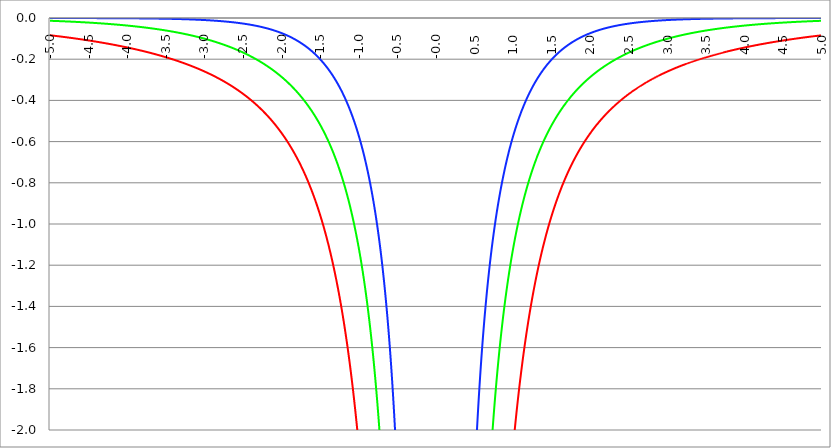
| Category | Series 1 | Series 0 | Series 2 |
|---|---|---|---|
| -5.0 | -0.084 | -0.013 | 0 |
| -4.995 | -0.084 | -0.014 | 0 |
| -4.99 | -0.084 | -0.014 | 0 |
| -4.985 | -0.084 | -0.014 | 0 |
| -4.98 | -0.085 | -0.014 | 0 |
| -4.975 | -0.085 | -0.014 | 0 |
| -4.97 | -0.085 | -0.014 | 0 |
| -4.965000000000001 | -0.085 | -0.014 | 0 |
| -4.960000000000001 | -0.086 | -0.014 | 0 |
| -4.955000000000001 | -0.086 | -0.014 | 0 |
| -4.950000000000001 | -0.086 | -0.014 | 0 |
| -4.945000000000001 | -0.086 | -0.014 | 0 |
| -4.940000000000001 | -0.086 | -0.014 | 0 |
| -4.935000000000001 | -0.087 | -0.014 | 0 |
| -4.930000000000001 | -0.087 | -0.014 | 0 |
| -4.925000000000002 | -0.087 | -0.015 | 0 |
| -4.920000000000002 | -0.087 | -0.015 | 0 |
| -4.915000000000002 | -0.088 | -0.015 | 0 |
| -4.910000000000002 | -0.088 | -0.015 | 0 |
| -4.905000000000002 | -0.088 | -0.015 | 0 |
| -4.900000000000002 | -0.088 | -0.015 | 0 |
| -4.895000000000002 | -0.088 | -0.015 | 0 |
| -4.890000000000002 | -0.089 | -0.015 | 0 |
| -4.885000000000002 | -0.089 | -0.015 | 0 |
| -4.880000000000002 | -0.089 | -0.015 | 0 |
| -4.875000000000003 | -0.089 | -0.015 | 0 |
| -4.870000000000003 | -0.09 | -0.015 | 0 |
| -4.865000000000003 | -0.09 | -0.015 | 0 |
| -4.860000000000003 | -0.09 | -0.016 | 0 |
| -4.855000000000003 | -0.09 | -0.016 | 0 |
| -4.850000000000003 | -0.091 | -0.016 | 0 |
| -4.845000000000003 | -0.091 | -0.016 | 0 |
| -4.840000000000003 | -0.091 | -0.016 | 0 |
| -4.835000000000003 | -0.091 | -0.016 | 0 |
| -4.830000000000004 | -0.092 | -0.016 | 0 |
| -4.825000000000004 | -0.092 | -0.016 | 0 |
| -4.820000000000004 | -0.092 | -0.016 | 0 |
| -4.815000000000004 | -0.092 | -0.016 | 0 |
| -4.810000000000004 | -0.093 | -0.016 | 0 |
| -4.805000000000004 | -0.093 | -0.016 | 0 |
| -4.800000000000004 | -0.093 | -0.016 | 0 |
| -4.795000000000004 | -0.093 | -0.017 | 0 |
| -4.790000000000004 | -0.093 | -0.017 | 0 |
| -4.785000000000004 | -0.094 | -0.017 | 0 |
| -4.780000000000004 | -0.094 | -0.017 | 0 |
| -4.775000000000004 | -0.094 | -0.017 | 0 |
| -4.770000000000004 | -0.094 | -0.017 | 0 |
| -4.765000000000005 | -0.095 | -0.017 | 0 |
| -4.760000000000005 | -0.095 | -0.017 | 0 |
| -4.755000000000005 | -0.095 | -0.017 | 0 |
| -4.750000000000005 | -0.095 | -0.017 | 0 |
| -4.745000000000005 | -0.096 | -0.017 | 0 |
| -4.740000000000005 | -0.096 | -0.017 | 0 |
| -4.735000000000005 | -0.096 | -0.018 | 0 |
| -4.730000000000005 | -0.096 | -0.018 | 0 |
| -4.725000000000006 | -0.097 | -0.018 | 0 |
| -4.720000000000006 | -0.097 | -0.018 | 0 |
| -4.715000000000006 | -0.097 | -0.018 | 0 |
| -4.710000000000006 | -0.097 | -0.018 | 0 |
| -4.705000000000006 | -0.098 | -0.018 | 0 |
| -4.700000000000006 | -0.098 | -0.018 | 0 |
| -4.695000000000006 | -0.098 | -0.018 | 0 |
| -4.690000000000006 | -0.099 | -0.018 | 0 |
| -4.685000000000007 | -0.099 | -0.018 | 0 |
| -4.680000000000007 | -0.099 | -0.019 | 0 |
| -4.675000000000007 | -0.099 | -0.019 | 0 |
| -4.670000000000007 | -0.1 | -0.019 | 0 |
| -4.665000000000007 | -0.1 | -0.019 | 0 |
| -4.660000000000007 | -0.1 | -0.019 | 0 |
| -4.655000000000007 | -0.1 | -0.019 | 0 |
| -4.650000000000007 | -0.101 | -0.019 | 0 |
| -4.645000000000007 | -0.101 | -0.019 | 0 |
| -4.640000000000008 | -0.101 | -0.019 | 0 |
| -4.635000000000008 | -0.101 | -0.019 | 0 |
| -4.630000000000008 | -0.102 | -0.02 | 0 |
| -4.625000000000008 | -0.102 | -0.02 | 0 |
| -4.620000000000008 | -0.102 | -0.02 | 0 |
| -4.615000000000008 | -0.103 | -0.02 | 0 |
| -4.610000000000008 | -0.103 | -0.02 | 0 |
| -4.605000000000008 | -0.103 | -0.02 | 0 |
| -4.600000000000008 | -0.103 | -0.02 | 0 |
| -4.595000000000009 | -0.104 | -0.02 | 0 |
| -4.590000000000009 | -0.104 | -0.02 | 0 |
| -4.585000000000009 | -0.104 | -0.02 | 0 |
| -4.580000000000009 | -0.104 | -0.021 | 0 |
| -4.57500000000001 | -0.105 | -0.021 | 0 |
| -4.57000000000001 | -0.105 | -0.021 | 0 |
| -4.565000000000009 | -0.105 | -0.021 | 0 |
| -4.560000000000009 | -0.106 | -0.021 | 0 |
| -4.555000000000009 | -0.106 | -0.021 | 0 |
| -4.55000000000001 | -0.106 | -0.021 | 0 |
| -4.54500000000001 | -0.106 | -0.021 | 0 |
| -4.54000000000001 | -0.107 | -0.021 | 0 |
| -4.53500000000001 | -0.107 | -0.021 | 0 |
| -4.53000000000001 | -0.107 | -0.022 | 0 |
| -4.52500000000001 | -0.108 | -0.022 | 0 |
| -4.52000000000001 | -0.108 | -0.022 | 0 |
| -4.51500000000001 | -0.108 | -0.022 | 0 |
| -4.51000000000001 | -0.108 | -0.022 | 0 |
| -4.505000000000011 | -0.109 | -0.022 | 0 |
| -4.500000000000011 | -0.109 | -0.022 | 0 |
| -4.495000000000011 | -0.109 | -0.022 | 0 |
| -4.490000000000011 | -0.11 | -0.022 | -0.001 |
| -4.485000000000011 | -0.11 | -0.023 | -0.001 |
| -4.480000000000011 | -0.11 | -0.023 | -0.001 |
| -4.475000000000011 | -0.11 | -0.023 | -0.001 |
| -4.470000000000011 | -0.111 | -0.023 | -0.001 |
| -4.465000000000011 | -0.111 | -0.023 | -0.001 |
| -4.460000000000011 | -0.111 | -0.023 | -0.001 |
| -4.455000000000012 | -0.112 | -0.023 | -0.001 |
| -4.450000000000012 | -0.112 | -0.023 | -0.001 |
| -4.445000000000012 | -0.112 | -0.023 | -0.001 |
| -4.440000000000012 | -0.113 | -0.024 | -0.001 |
| -4.435000000000012 | -0.113 | -0.024 | -0.001 |
| -4.430000000000012 | -0.113 | -0.024 | -0.001 |
| -4.425000000000012 | -0.113 | -0.024 | -0.001 |
| -4.420000000000012 | -0.114 | -0.024 | -0.001 |
| -4.415000000000012 | -0.114 | -0.024 | -0.001 |
| -4.410000000000013 | -0.114 | -0.024 | -0.001 |
| -4.405000000000013 | -0.115 | -0.024 | -0.001 |
| -4.400000000000013 | -0.115 | -0.025 | -0.001 |
| -4.395000000000013 | -0.115 | -0.025 | -0.001 |
| -4.390000000000013 | -0.116 | -0.025 | -0.001 |
| -4.385000000000013 | -0.116 | -0.025 | -0.001 |
| -4.380000000000013 | -0.116 | -0.025 | -0.001 |
| -4.375000000000013 | -0.117 | -0.025 | -0.001 |
| -4.370000000000013 | -0.117 | -0.025 | -0.001 |
| -4.365000000000013 | -0.117 | -0.025 | -0.001 |
| -4.360000000000014 | -0.117 | -0.026 | -0.001 |
| -4.355000000000014 | -0.118 | -0.026 | -0.001 |
| -4.350000000000014 | -0.118 | -0.026 | -0.001 |
| -4.345000000000014 | -0.118 | -0.026 | -0.001 |
| -4.340000000000014 | -0.119 | -0.026 | -0.001 |
| -4.335000000000014 | -0.119 | -0.026 | -0.001 |
| -4.330000000000014 | -0.119 | -0.026 | -0.001 |
| -4.325000000000014 | -0.12 | -0.026 | -0.001 |
| -4.320000000000014 | -0.12 | -0.027 | -0.001 |
| -4.315000000000015 | -0.12 | -0.027 | -0.001 |
| -4.310000000000015 | -0.121 | -0.027 | -0.001 |
| -4.305000000000015 | -0.121 | -0.027 | -0.001 |
| -4.300000000000015 | -0.121 | -0.027 | -0.001 |
| -4.295000000000015 | -0.122 | -0.027 | -0.001 |
| -4.290000000000015 | -0.122 | -0.027 | -0.001 |
| -4.285000000000015 | -0.122 | -0.028 | -0.001 |
| -4.280000000000015 | -0.123 | -0.028 | -0.001 |
| -4.275000000000015 | -0.123 | -0.028 | -0.001 |
| -4.270000000000015 | -0.123 | -0.028 | -0.001 |
| -4.265000000000016 | -0.124 | -0.028 | -0.001 |
| -4.260000000000016 | -0.124 | -0.028 | -0.001 |
| -4.255000000000016 | -0.124 | -0.028 | -0.001 |
| -4.250000000000016 | -0.125 | -0.029 | -0.001 |
| -4.245000000000016 | -0.125 | -0.029 | -0.001 |
| -4.240000000000016 | -0.125 | -0.029 | -0.001 |
| -4.235000000000016 | -0.126 | -0.029 | -0.001 |
| -4.230000000000016 | -0.126 | -0.029 | -0.001 |
| -4.225000000000017 | -0.126 | -0.029 | -0.001 |
| -4.220000000000017 | -0.127 | -0.029 | -0.001 |
| -4.215000000000017 | -0.127 | -0.03 | -0.001 |
| -4.210000000000017 | -0.127 | -0.03 | -0.001 |
| -4.205000000000017 | -0.128 | -0.03 | -0.001 |
| -4.200000000000017 | -0.128 | -0.03 | -0.001 |
| -4.195000000000017 | -0.128 | -0.03 | -0.001 |
| -4.190000000000017 | -0.129 | -0.03 | -0.001 |
| -4.185000000000017 | -0.129 | -0.03 | -0.001 |
| -4.180000000000017 | -0.13 | -0.031 | -0.001 |
| -4.175000000000018 | -0.13 | -0.031 | -0.001 |
| -4.170000000000018 | -0.13 | -0.031 | -0.001 |
| -4.165000000000018 | -0.131 | -0.031 | -0.001 |
| -4.160000000000018 | -0.131 | -0.031 | -0.001 |
| -4.155000000000018 | -0.131 | -0.031 | -0.001 |
| -4.150000000000018 | -0.132 | -0.032 | -0.001 |
| -4.145000000000018 | -0.132 | -0.032 | -0.001 |
| -4.140000000000018 | -0.132 | -0.032 | -0.001 |
| -4.135000000000018 | -0.133 | -0.032 | -0.001 |
| -4.130000000000019 | -0.133 | -0.032 | -0.001 |
| -4.125000000000019 | -0.133 | -0.032 | -0.001 |
| -4.120000000000019 | -0.134 | -0.033 | -0.001 |
| -4.115000000000019 | -0.134 | -0.033 | -0.001 |
| -4.110000000000019 | -0.135 | -0.033 | -0.001 |
| -4.105000000000019 | -0.135 | -0.033 | -0.001 |
| -4.100000000000019 | -0.135 | -0.033 | -0.001 |
| -4.095000000000019 | -0.136 | -0.033 | -0.001 |
| -4.090000000000019 | -0.136 | -0.034 | -0.001 |
| -4.085000000000019 | -0.136 | -0.034 | -0.001 |
| -4.08000000000002 | -0.137 | -0.034 | -0.001 |
| -4.07500000000002 | -0.137 | -0.034 | -0.001 |
| -4.07000000000002 | -0.138 | -0.034 | -0.001 |
| -4.06500000000002 | -0.138 | -0.034 | -0.001 |
| -4.06000000000002 | -0.138 | -0.035 | -0.001 |
| -4.05500000000002 | -0.139 | -0.035 | -0.001 |
| -4.05000000000002 | -0.139 | -0.035 | -0.001 |
| -4.04500000000002 | -0.139 | -0.035 | -0.001 |
| -4.04000000000002 | -0.14 | -0.035 | -0.001 |
| -4.03500000000002 | -0.14 | -0.035 | -0.001 |
| -4.03000000000002 | -0.141 | -0.036 | -0.001 |
| -4.025000000000021 | -0.141 | -0.036 | -0.001 |
| -4.020000000000021 | -0.141 | -0.036 | -0.001 |
| -4.015000000000021 | -0.142 | -0.036 | -0.001 |
| -4.010000000000021 | -0.142 | -0.036 | -0.001 |
| -4.005000000000021 | -0.143 | -0.036 | -0.001 |
| -4.000000000000021 | -0.143 | -0.037 | -0.001 |
| -3.995000000000021 | -0.143 | -0.037 | -0.001 |
| -3.990000000000021 | -0.144 | -0.037 | -0.001 |
| -3.985000000000022 | -0.144 | -0.037 | -0.001 |
| -3.980000000000022 | -0.145 | -0.037 | -0.001 |
| -3.975000000000022 | -0.145 | -0.038 | -0.001 |
| -3.970000000000022 | -0.145 | -0.038 | -0.001 |
| -3.965000000000022 | -0.146 | -0.038 | -0.001 |
| -3.960000000000022 | -0.146 | -0.038 | -0.001 |
| -3.955000000000022 | -0.147 | -0.038 | -0.001 |
| -3.950000000000022 | -0.147 | -0.039 | -0.001 |
| -3.945000000000022 | -0.147 | -0.039 | -0.001 |
| -3.940000000000023 | -0.148 | -0.039 | -0.002 |
| -3.935000000000023 | -0.148 | -0.039 | -0.002 |
| -3.930000000000023 | -0.149 | -0.039 | -0.002 |
| -3.925000000000023 | -0.149 | -0.04 | -0.002 |
| -3.920000000000023 | -0.15 | -0.04 | -0.002 |
| -3.915000000000023 | -0.15 | -0.04 | -0.002 |
| -3.910000000000023 | -0.15 | -0.04 | -0.002 |
| -3.905000000000023 | -0.151 | -0.04 | -0.002 |
| -3.900000000000023 | -0.151 | -0.041 | -0.002 |
| -3.895000000000023 | -0.152 | -0.041 | -0.002 |
| -3.890000000000024 | -0.152 | -0.041 | -0.002 |
| -3.885000000000024 | -0.152 | -0.041 | -0.002 |
| -3.880000000000024 | -0.153 | -0.041 | -0.002 |
| -3.875000000000024 | -0.153 | -0.042 | -0.002 |
| -3.870000000000024 | -0.154 | -0.042 | -0.002 |
| -3.865000000000024 | -0.154 | -0.042 | -0.002 |
| -3.860000000000024 | -0.155 | -0.042 | -0.002 |
| -3.855000000000024 | -0.155 | -0.042 | -0.002 |
| -3.850000000000024 | -0.156 | -0.043 | -0.002 |
| -3.845000000000025 | -0.156 | -0.043 | -0.002 |
| -3.840000000000025 | -0.156 | -0.043 | -0.002 |
| -3.835000000000025 | -0.157 | -0.043 | -0.002 |
| -3.830000000000025 | -0.157 | -0.043 | -0.002 |
| -3.825000000000025 | -0.158 | -0.044 | -0.002 |
| -3.820000000000025 | -0.158 | -0.044 | -0.002 |
| -3.815000000000025 | -0.159 | -0.044 | -0.002 |
| -3.810000000000025 | -0.159 | -0.044 | -0.002 |
| -3.805000000000025 | -0.16 | -0.045 | -0.002 |
| -3.800000000000026 | -0.16 | -0.045 | -0.002 |
| -3.795000000000026 | -0.16 | -0.045 | -0.002 |
| -3.790000000000026 | -0.161 | -0.045 | -0.002 |
| -3.785000000000026 | -0.161 | -0.045 | -0.002 |
| -3.780000000000026 | -0.162 | -0.046 | -0.002 |
| -3.775000000000026 | -0.162 | -0.046 | -0.002 |
| -3.770000000000026 | -0.163 | -0.046 | -0.002 |
| -3.765000000000026 | -0.163 | -0.046 | -0.002 |
| -3.760000000000026 | -0.164 | -0.047 | -0.002 |
| -3.755000000000026 | -0.164 | -0.047 | -0.002 |
| -3.750000000000027 | -0.165 | -0.047 | -0.002 |
| -3.745000000000027 | -0.165 | -0.047 | -0.002 |
| -3.740000000000027 | -0.166 | -0.048 | -0.002 |
| -3.735000000000027 | -0.166 | -0.048 | -0.002 |
| -3.730000000000027 | -0.167 | -0.048 | -0.002 |
| -3.725000000000027 | -0.167 | -0.048 | -0.002 |
| -3.720000000000027 | -0.167 | -0.049 | -0.002 |
| -3.715000000000027 | -0.168 | -0.049 | -0.002 |
| -3.710000000000027 | -0.168 | -0.049 | -0.002 |
| -3.705000000000028 | -0.169 | -0.049 | -0.002 |
| -3.700000000000028 | -0.169 | -0.05 | -0.002 |
| -3.695000000000028 | -0.17 | -0.05 | -0.002 |
| -3.690000000000028 | -0.17 | -0.05 | -0.002 |
| -3.685000000000028 | -0.171 | -0.05 | -0.003 |
| -3.680000000000028 | -0.171 | -0.051 | -0.003 |
| -3.675000000000028 | -0.172 | -0.051 | -0.003 |
| -3.670000000000028 | -0.172 | -0.051 | -0.003 |
| -3.665000000000028 | -0.173 | -0.051 | -0.003 |
| -3.660000000000028 | -0.173 | -0.052 | -0.003 |
| -3.655000000000029 | -0.174 | -0.052 | -0.003 |
| -3.650000000000029 | -0.174 | -0.052 | -0.003 |
| -3.645000000000029 | -0.175 | -0.052 | -0.003 |
| -3.640000000000029 | -0.175 | -0.053 | -0.003 |
| -3.635000000000029 | -0.176 | -0.053 | -0.003 |
| -3.630000000000029 | -0.176 | -0.053 | -0.003 |
| -3.625000000000029 | -0.177 | -0.053 | -0.003 |
| -3.620000000000029 | -0.177 | -0.054 | -0.003 |
| -3.615000000000029 | -0.178 | -0.054 | -0.003 |
| -3.61000000000003 | -0.178 | -0.054 | -0.003 |
| -3.60500000000003 | -0.179 | -0.054 | -0.003 |
| -3.60000000000003 | -0.179 | -0.055 | -0.003 |
| -3.59500000000003 | -0.18 | -0.055 | -0.003 |
| -3.59000000000003 | -0.181 | -0.055 | -0.003 |
| -3.58500000000003 | -0.181 | -0.056 | -0.003 |
| -3.58000000000003 | -0.182 | -0.056 | -0.003 |
| -3.57500000000003 | -0.182 | -0.056 | -0.003 |
| -3.57000000000003 | -0.183 | -0.056 | -0.003 |
| -3.565000000000031 | -0.183 | -0.057 | -0.003 |
| -3.560000000000031 | -0.184 | -0.057 | -0.003 |
| -3.555000000000031 | -0.184 | -0.057 | -0.003 |
| -3.550000000000031 | -0.185 | -0.058 | -0.003 |
| -3.545000000000031 | -0.185 | -0.058 | -0.003 |
| -3.540000000000031 | -0.186 | -0.058 | -0.003 |
| -3.535000000000031 | -0.186 | -0.058 | -0.003 |
| -3.530000000000031 | -0.187 | -0.059 | -0.003 |
| -3.525000000000031 | -0.188 | -0.059 | -0.003 |
| -3.520000000000032 | -0.188 | -0.059 | -0.004 |
| -3.515000000000032 | -0.189 | -0.06 | -0.004 |
| -3.510000000000032 | -0.189 | -0.06 | -0.004 |
| -3.505000000000032 | -0.19 | -0.06 | -0.004 |
| -3.500000000000032 | -0.19 | -0.061 | -0.004 |
| -3.495000000000032 | -0.191 | -0.061 | -0.004 |
| -3.490000000000032 | -0.191 | -0.061 | -0.004 |
| -3.485000000000032 | -0.192 | -0.061 | -0.004 |
| -3.480000000000032 | -0.193 | -0.062 | -0.004 |
| -3.475000000000032 | -0.193 | -0.062 | -0.004 |
| -3.470000000000033 | -0.194 | -0.062 | -0.004 |
| -3.465000000000033 | -0.194 | -0.063 | -0.004 |
| -3.460000000000033 | -0.195 | -0.063 | -0.004 |
| -3.455000000000033 | -0.195 | -0.063 | -0.004 |
| -3.450000000000033 | -0.196 | -0.064 | -0.004 |
| -3.445000000000033 | -0.197 | -0.064 | -0.004 |
| -3.440000000000033 | -0.197 | -0.064 | -0.004 |
| -3.435000000000033 | -0.198 | -0.065 | -0.004 |
| -3.430000000000033 | -0.198 | -0.065 | -0.004 |
| -3.425000000000034 | -0.199 | -0.065 | -0.004 |
| -3.420000000000034 | -0.2 | -0.066 | -0.004 |
| -3.415000000000034 | -0.2 | -0.066 | -0.004 |
| -3.410000000000034 | -0.201 | -0.066 | -0.004 |
| -3.405000000000034 | -0.201 | -0.067 | -0.004 |
| -3.400000000000034 | -0.202 | -0.067 | -0.004 |
| -3.395000000000034 | -0.203 | -0.067 | -0.004 |
| -3.390000000000034 | -0.203 | -0.068 | -0.005 |
| -3.385000000000034 | -0.204 | -0.068 | -0.005 |
| -3.380000000000034 | -0.204 | -0.068 | -0.005 |
| -3.375000000000035 | -0.205 | -0.069 | -0.005 |
| -3.370000000000035 | -0.206 | -0.069 | -0.005 |
| -3.365000000000035 | -0.206 | -0.069 | -0.005 |
| -3.360000000000035 | -0.207 | -0.07 | -0.005 |
| -3.355000000000035 | -0.208 | -0.07 | -0.005 |
| -3.350000000000035 | -0.208 | -0.07 | -0.005 |
| -3.345000000000035 | -0.209 | -0.071 | -0.005 |
| -3.340000000000035 | -0.21 | -0.071 | -0.005 |
| -3.335000000000035 | -0.21 | -0.072 | -0.005 |
| -3.330000000000036 | -0.211 | -0.072 | -0.005 |
| -3.325000000000036 | -0.211 | -0.072 | -0.005 |
| -3.320000000000036 | -0.212 | -0.073 | -0.005 |
| -3.315000000000036 | -0.213 | -0.073 | -0.005 |
| -3.310000000000036 | -0.213 | -0.073 | -0.005 |
| -3.305000000000036 | -0.214 | -0.074 | -0.005 |
| -3.300000000000036 | -0.215 | -0.074 | -0.005 |
| -3.295000000000036 | -0.215 | -0.074 | -0.005 |
| -3.290000000000036 | -0.216 | -0.075 | -0.006 |
| -3.285000000000036 | -0.217 | -0.075 | -0.006 |
| -3.280000000000036 | -0.217 | -0.076 | -0.006 |
| -3.275000000000037 | -0.218 | -0.076 | -0.006 |
| -3.270000000000037 | -0.219 | -0.076 | -0.006 |
| -3.265000000000037 | -0.219 | -0.077 | -0.006 |
| -3.260000000000037 | -0.22 | -0.077 | -0.006 |
| -3.255000000000037 | -0.221 | -0.078 | -0.006 |
| -3.250000000000037 | -0.221 | -0.078 | -0.006 |
| -3.245000000000037 | -0.222 | -0.078 | -0.006 |
| -3.240000000000037 | -0.223 | -0.079 | -0.006 |
| -3.235000000000038 | -0.223 | -0.079 | -0.006 |
| -3.230000000000038 | -0.224 | -0.079 | -0.006 |
| -3.225000000000038 | -0.225 | -0.08 | -0.006 |
| -3.220000000000038 | -0.226 | -0.08 | -0.006 |
| -3.215000000000038 | -0.226 | -0.081 | -0.006 |
| -3.210000000000038 | -0.227 | -0.081 | -0.007 |
| -3.205000000000038 | -0.228 | -0.082 | -0.007 |
| -3.200000000000038 | -0.228 | -0.082 | -0.007 |
| -3.195000000000038 | -0.229 | -0.082 | -0.007 |
| -3.190000000000039 | -0.23 | -0.083 | -0.007 |
| -3.185000000000039 | -0.231 | -0.083 | -0.007 |
| -3.180000000000039 | -0.231 | -0.084 | -0.007 |
| -3.175000000000039 | -0.232 | -0.084 | -0.007 |
| -3.170000000000039 | -0.233 | -0.084 | -0.007 |
| -3.16500000000004 | -0.233 | -0.085 | -0.007 |
| -3.16000000000004 | -0.234 | -0.085 | -0.007 |
| -3.155000000000039 | -0.235 | -0.086 | -0.007 |
| -3.150000000000039 | -0.236 | -0.086 | -0.007 |
| -3.14500000000004 | -0.236 | -0.087 | -0.007 |
| -3.14000000000004 | -0.237 | -0.087 | -0.007 |
| -3.13500000000004 | -0.238 | -0.087 | -0.008 |
| -3.13000000000004 | -0.239 | -0.088 | -0.008 |
| -3.12500000000004 | -0.239 | -0.088 | -0.008 |
| -3.12000000000004 | -0.24 | -0.089 | -0.008 |
| -3.11500000000004 | -0.241 | -0.089 | -0.008 |
| -3.11000000000004 | -0.242 | -0.09 | -0.008 |
| -3.10500000000004 | -0.242 | -0.09 | -0.008 |
| -3.10000000000004 | -0.243 | -0.091 | -0.008 |
| -3.095000000000041 | -0.244 | -0.091 | -0.008 |
| -3.090000000000041 | -0.245 | -0.092 | -0.008 |
| -3.085000000000041 | -0.246 | -0.092 | -0.008 |
| -3.080000000000041 | -0.246 | -0.093 | -0.008 |
| -3.075000000000041 | -0.247 | -0.093 | -0.009 |
| -3.070000000000041 | -0.248 | -0.093 | -0.009 |
| -3.065000000000041 | -0.249 | -0.094 | -0.009 |
| -3.060000000000041 | -0.25 | -0.094 | -0.009 |
| -3.055000000000041 | -0.25 | -0.095 | -0.009 |
| -3.050000000000042 | -0.251 | -0.095 | -0.009 |
| -3.045000000000042 | -0.252 | -0.096 | -0.009 |
| -3.040000000000042 | -0.253 | -0.096 | -0.009 |
| -3.035000000000042 | -0.254 | -0.097 | -0.009 |
| -3.030000000000042 | -0.254 | -0.097 | -0.009 |
| -3.025000000000042 | -0.255 | -0.098 | -0.009 |
| -3.020000000000042 | -0.256 | -0.098 | -0.01 |
| -3.015000000000042 | -0.257 | -0.099 | -0.01 |
| -3.010000000000042 | -0.258 | -0.099 | -0.01 |
| -3.005000000000043 | -0.259 | -0.1 | -0.01 |
| -3.000000000000043 | -0.259 | -0.1 | -0.01 |
| -2.995000000000043 | -0.26 | -0.101 | -0.01 |
| -2.990000000000043 | -0.261 | -0.101 | -0.01 |
| -2.985000000000043 | -0.262 | -0.102 | -0.01 |
| -2.980000000000043 | -0.263 | -0.102 | -0.01 |
| -2.975000000000043 | -0.264 | -0.103 | -0.01 |
| -2.970000000000043 | -0.265 | -0.103 | -0.011 |
| -2.965000000000043 | -0.265 | -0.104 | -0.011 |
| -2.960000000000043 | -0.266 | -0.104 | -0.011 |
| -2.955000000000044 | -0.267 | -0.105 | -0.011 |
| -2.950000000000044 | -0.268 | -0.106 | -0.011 |
| -2.945000000000044 | -0.269 | -0.106 | -0.011 |
| -2.940000000000044 | -0.27 | -0.107 | -0.011 |
| -2.935000000000044 | -0.271 | -0.107 | -0.011 |
| -2.930000000000044 | -0.272 | -0.108 | -0.011 |
| -2.925000000000044 | -0.273 | -0.108 | -0.012 |
| -2.920000000000044 | -0.273 | -0.109 | -0.012 |
| -2.915000000000044 | -0.274 | -0.109 | -0.012 |
| -2.910000000000045 | -0.275 | -0.11 | -0.012 |
| -2.905000000000045 | -0.276 | -0.11 | -0.012 |
| -2.900000000000045 | -0.277 | -0.111 | -0.012 |
| -2.895000000000045 | -0.278 | -0.112 | -0.012 |
| -2.890000000000045 | -0.279 | -0.112 | -0.012 |
| -2.885000000000045 | -0.28 | -0.113 | -0.012 |
| -2.880000000000045 | -0.281 | -0.113 | -0.013 |
| -2.875000000000045 | -0.282 | -0.114 | -0.013 |
| -2.870000000000045 | -0.283 | -0.114 | -0.013 |
| -2.865000000000045 | -0.284 | -0.115 | -0.013 |
| -2.860000000000046 | -0.285 | -0.116 | -0.013 |
| -2.855000000000046 | -0.286 | -0.116 | -0.013 |
| -2.850000000000046 | -0.287 | -0.117 | -0.013 |
| -2.845000000000046 | -0.288 | -0.117 | -0.014 |
| -2.840000000000046 | -0.289 | -0.118 | -0.014 |
| -2.835000000000046 | -0.29 | -0.119 | -0.014 |
| -2.830000000000046 | -0.291 | -0.119 | -0.014 |
| -2.825000000000046 | -0.292 | -0.12 | -0.014 |
| -2.820000000000046 | -0.293 | -0.12 | -0.014 |
| -2.815000000000047 | -0.294 | -0.121 | -0.014 |
| -2.810000000000047 | -0.295 | -0.122 | -0.014 |
| -2.805000000000047 | -0.296 | -0.122 | -0.015 |
| -2.800000000000047 | -0.297 | -0.123 | -0.015 |
| -2.795000000000047 | -0.298 | -0.124 | -0.015 |
| -2.790000000000047 | -0.299 | -0.124 | -0.015 |
| -2.785000000000047 | -0.3 | -0.125 | -0.015 |
| -2.780000000000047 | -0.301 | -0.126 | -0.015 |
| -2.775000000000047 | -0.302 | -0.126 | -0.016 |
| -2.770000000000047 | -0.303 | -0.127 | -0.016 |
| -2.765000000000048 | -0.304 | -0.127 | -0.016 |
| -2.760000000000048 | -0.305 | -0.128 | -0.016 |
| -2.755000000000048 | -0.306 | -0.129 | -0.016 |
| -2.750000000000048 | -0.307 | -0.129 | -0.016 |
| -2.745000000000048 | -0.308 | -0.13 | -0.017 |
| -2.740000000000048 | -0.309 | -0.131 | -0.017 |
| -2.735000000000048 | -0.31 | -0.131 | -0.017 |
| -2.730000000000048 | -0.311 | -0.132 | -0.017 |
| -2.725000000000048 | -0.312 | -0.133 | -0.017 |
| -2.720000000000049 | -0.314 | -0.133 | -0.017 |
| -2.715000000000049 | -0.315 | -0.134 | -0.018 |
| -2.710000000000049 | -0.316 | -0.135 | -0.018 |
| -2.705000000000049 | -0.317 | -0.136 | -0.018 |
| -2.700000000000049 | -0.318 | -0.136 | -0.018 |
| -2.695000000000049 | -0.319 | -0.137 | -0.018 |
| -2.690000000000049 | -0.32 | -0.138 | -0.018 |
| -2.685000000000049 | -0.321 | -0.138 | -0.019 |
| -2.680000000000049 | -0.323 | -0.139 | -0.019 |
| -2.675000000000049 | -0.324 | -0.14 | -0.019 |
| -2.67000000000005 | -0.325 | -0.141 | -0.019 |
| -2.66500000000005 | -0.326 | -0.141 | -0.019 |
| -2.66000000000005 | -0.327 | -0.142 | -0.02 |
| -2.65500000000005 | -0.328 | -0.143 | -0.02 |
| -2.65000000000005 | -0.329 | -0.143 | -0.02 |
| -2.64500000000005 | -0.331 | -0.144 | -0.02 |
| -2.64000000000005 | -0.332 | -0.145 | -0.02 |
| -2.63500000000005 | -0.333 | -0.146 | -0.021 |
| -2.63000000000005 | -0.334 | -0.146 | -0.021 |
| -2.625000000000051 | -0.335 | -0.147 | -0.021 |
| -2.620000000000051 | -0.337 | -0.148 | -0.021 |
| -2.615000000000051 | -0.338 | -0.149 | -0.021 |
| -2.610000000000051 | -0.339 | -0.149 | -0.022 |
| -2.605000000000051 | -0.34 | -0.15 | -0.022 |
| -2.600000000000051 | -0.342 | -0.151 | -0.022 |
| -2.595000000000051 | -0.343 | -0.152 | -0.022 |
| -2.590000000000051 | -0.344 | -0.153 | -0.023 |
| -2.585000000000051 | -0.345 | -0.153 | -0.023 |
| -2.580000000000052 | -0.347 | -0.154 | -0.023 |
| -2.575000000000052 | -0.348 | -0.155 | -0.023 |
| -2.570000000000052 | -0.349 | -0.156 | -0.023 |
| -2.565000000000052 | -0.351 | -0.157 | -0.024 |
| -2.560000000000052 | -0.352 | -0.157 | -0.024 |
| -2.555000000000052 | -0.353 | -0.158 | -0.024 |
| -2.550000000000052 | -0.354 | -0.159 | -0.024 |
| -2.545000000000052 | -0.356 | -0.16 | -0.025 |
| -2.540000000000052 | -0.357 | -0.161 | -0.025 |
| -2.535000000000053 | -0.358 | -0.162 | -0.025 |
| -2.530000000000053 | -0.36 | -0.162 | -0.025 |
| -2.525000000000053 | -0.361 | -0.163 | -0.026 |
| -2.520000000000053 | -0.362 | -0.164 | -0.026 |
| -2.515000000000053 | -0.364 | -0.165 | -0.026 |
| -2.510000000000053 | -0.365 | -0.166 | -0.026 |
| -2.505000000000053 | -0.367 | -0.167 | -0.027 |
| -2.500000000000053 | -0.368 | -0.168 | -0.027 |
| -2.495000000000053 | -0.369 | -0.168 | -0.027 |
| -2.490000000000053 | -0.371 | -0.169 | -0.028 |
| -2.485000000000054 | -0.372 | -0.17 | -0.028 |
| -2.480000000000054 | -0.374 | -0.171 | -0.028 |
| -2.475000000000054 | -0.375 | -0.172 | -0.028 |
| -2.470000000000054 | -0.376 | -0.173 | -0.029 |
| -2.465000000000054 | -0.378 | -0.174 | -0.029 |
| -2.460000000000054 | -0.379 | -0.175 | -0.029 |
| -2.455000000000054 | -0.381 | -0.176 | -0.029 |
| -2.450000000000054 | -0.382 | -0.176 | -0.03 |
| -2.445000000000054 | -0.384 | -0.177 | -0.03 |
| -2.440000000000055 | -0.385 | -0.178 | -0.03 |
| -2.435000000000055 | -0.387 | -0.179 | -0.031 |
| -2.430000000000055 | -0.388 | -0.18 | -0.031 |
| -2.425000000000055 | -0.39 | -0.181 | -0.031 |
| -2.420000000000055 | -0.391 | -0.182 | -0.032 |
| -2.415000000000055 | -0.393 | -0.183 | -0.032 |
| -2.410000000000055 | -0.394 | -0.184 | -0.032 |
| -2.405000000000055 | -0.396 | -0.185 | -0.033 |
| -2.400000000000055 | -0.397 | -0.186 | -0.033 |
| -2.395000000000055 | -0.399 | -0.187 | -0.033 |
| -2.390000000000056 | -0.4 | -0.188 | -0.034 |
| -2.385000000000056 | -0.402 | -0.189 | -0.034 |
| -2.380000000000056 | -0.404 | -0.19 | -0.034 |
| -2.375000000000056 | -0.405 | -0.191 | -0.035 |
| -2.370000000000056 | -0.407 | -0.192 | -0.035 |
| -2.365000000000056 | -0.408 | -0.193 | -0.035 |
| -2.360000000000056 | -0.41 | -0.194 | -0.036 |
| -2.355000000000056 | -0.412 | -0.195 | -0.036 |
| -2.350000000000056 | -0.413 | -0.196 | -0.036 |
| -2.345000000000057 | -0.415 | -0.197 | -0.037 |
| -2.340000000000057 | -0.417 | -0.198 | -0.037 |
| -2.335000000000057 | -0.418 | -0.199 | -0.037 |
| -2.330000000000057 | -0.42 | -0.2 | -0.038 |
| -2.325000000000057 | -0.422 | -0.201 | -0.038 |
| -2.320000000000057 | -0.423 | -0.202 | -0.039 |
| -2.315000000000057 | -0.425 | -0.203 | -0.039 |
| -2.310000000000057 | -0.427 | -0.204 | -0.039 |
| -2.305000000000057 | -0.429 | -0.206 | -0.04 |
| -2.300000000000058 | -0.43 | -0.207 | -0.04 |
| -2.295000000000058 | -0.432 | -0.208 | -0.041 |
| -2.290000000000058 | -0.434 | -0.209 | -0.041 |
| -2.285000000000058 | -0.436 | -0.21 | -0.041 |
| -2.280000000000058 | -0.437 | -0.211 | -0.042 |
| -2.275000000000058 | -0.439 | -0.212 | -0.042 |
| -2.270000000000058 | -0.441 | -0.213 | -0.043 |
| -2.265000000000058 | -0.443 | -0.214 | -0.043 |
| -2.260000000000058 | -0.445 | -0.216 | -0.044 |
| -2.255000000000058 | -0.447 | -0.217 | -0.044 |
| -2.250000000000059 | -0.448 | -0.218 | -0.044 |
| -2.245000000000059 | -0.45 | -0.219 | -0.045 |
| -2.240000000000059 | -0.452 | -0.22 | -0.045 |
| -2.235000000000059 | -0.454 | -0.221 | -0.046 |
| -2.23000000000006 | -0.456 | -0.223 | -0.046 |
| -2.22500000000006 | -0.458 | -0.224 | -0.047 |
| -2.22000000000006 | -0.46 | -0.225 | -0.047 |
| -2.215000000000059 | -0.462 | -0.226 | -0.048 |
| -2.210000000000059 | -0.464 | -0.227 | -0.048 |
| -2.20500000000006 | -0.466 | -0.229 | -0.049 |
| -2.20000000000006 | -0.468 | -0.23 | -0.049 |
| -2.19500000000006 | -0.47 | -0.231 | -0.05 |
| -2.19000000000006 | -0.472 | -0.232 | -0.05 |
| -2.18500000000006 | -0.474 | -0.234 | -0.051 |
| -2.18000000000006 | -0.476 | -0.235 | -0.051 |
| -2.17500000000006 | -0.478 | -0.236 | -0.052 |
| -2.17000000000006 | -0.48 | -0.237 | -0.052 |
| -2.16500000000006 | -0.482 | -0.239 | -0.053 |
| -2.160000000000061 | -0.484 | -0.24 | -0.053 |
| -2.155000000000061 | -0.486 | -0.241 | -0.054 |
| -2.150000000000061 | -0.488 | -0.243 | -0.054 |
| -2.145000000000061 | -0.49 | -0.244 | -0.055 |
| -2.140000000000061 | -0.492 | -0.245 | -0.055 |
| -2.135000000000061 | -0.495 | -0.247 | -0.056 |
| -2.130000000000061 | -0.497 | -0.248 | -0.057 |
| -2.125000000000061 | -0.499 | -0.249 | -0.057 |
| -2.120000000000061 | -0.501 | -0.251 | -0.058 |
| -2.115000000000061 | -0.503 | -0.252 | -0.058 |
| -2.110000000000062 | -0.506 | -0.253 | -0.059 |
| -2.105000000000062 | -0.508 | -0.255 | -0.059 |
| -2.100000000000062 | -0.51 | -0.256 | -0.06 |
| -2.095000000000062 | -0.512 | -0.258 | -0.061 |
| -2.090000000000062 | -0.515 | -0.259 | -0.061 |
| -2.085000000000062 | -0.517 | -0.26 | -0.062 |
| -2.080000000000062 | -0.519 | -0.262 | -0.062 |
| -2.075000000000062 | -0.522 | -0.263 | -0.063 |
| -2.070000000000062 | -0.524 | -0.265 | -0.064 |
| -2.065000000000063 | -0.526 | -0.266 | -0.064 |
| -2.060000000000063 | -0.529 | -0.268 | -0.065 |
| -2.055000000000063 | -0.531 | -0.269 | -0.066 |
| -2.050000000000063 | -0.534 | -0.271 | -0.066 |
| -2.045000000000063 | -0.536 | -0.272 | -0.067 |
| -2.040000000000063 | -0.538 | -0.274 | -0.068 |
| -2.035000000000063 | -0.541 | -0.275 | -0.068 |
| -2.030000000000063 | -0.543 | -0.277 | -0.069 |
| -2.025000000000063 | -0.546 | -0.278 | -0.07 |
| -2.020000000000064 | -0.548 | -0.28 | -0.07 |
| -2.015000000000064 | -0.551 | -0.281 | -0.071 |
| -2.010000000000064 | -0.553 | -0.283 | -0.072 |
| -2.005000000000064 | -0.556 | -0.284 | -0.073 |
| -2.000000000000064 | -0.559 | -0.286 | -0.073 |
| -1.995000000000064 | -0.561 | -0.288 | -0.074 |
| -1.990000000000064 | -0.564 | -0.289 | -0.075 |
| -1.985000000000064 | -0.567 | -0.291 | -0.076 |
| -1.980000000000064 | -0.569 | -0.292 | -0.076 |
| -1.975000000000064 | -0.572 | -0.294 | -0.077 |
| -1.970000000000065 | -0.575 | -0.296 | -0.078 |
| -1.965000000000065 | -0.577 | -0.297 | -0.079 |
| -1.960000000000065 | -0.58 | -0.299 | -0.079 |
| -1.955000000000065 | -0.583 | -0.301 | -0.08 |
| -1.950000000000065 | -0.586 | -0.302 | -0.081 |
| -1.945000000000065 | -0.588 | -0.304 | -0.082 |
| -1.940000000000065 | -0.591 | -0.306 | -0.083 |
| -1.935000000000065 | -0.594 | -0.308 | -0.084 |
| -1.930000000000065 | -0.597 | -0.309 | -0.084 |
| -1.925000000000066 | -0.6 | -0.311 | -0.085 |
| -1.920000000000066 | -0.603 | -0.313 | -0.086 |
| -1.915000000000066 | -0.606 | -0.315 | -0.087 |
| -1.910000000000066 | -0.609 | -0.316 | -0.088 |
| -1.905000000000066 | -0.612 | -0.318 | -0.089 |
| -1.900000000000066 | -0.615 | -0.32 | -0.09 |
| -1.895000000000066 | -0.618 | -0.322 | -0.091 |
| -1.890000000000066 | -0.621 | -0.324 | -0.091 |
| -1.885000000000066 | -0.624 | -0.325 | -0.092 |
| -1.880000000000066 | -0.627 | -0.327 | -0.093 |
| -1.875000000000067 | -0.63 | -0.329 | -0.094 |
| -1.870000000000067 | -0.633 | -0.331 | -0.095 |
| -1.865000000000067 | -0.636 | -0.333 | -0.096 |
| -1.860000000000067 | -0.64 | -0.335 | -0.097 |
| -1.855000000000067 | -0.643 | -0.337 | -0.098 |
| -1.850000000000067 | -0.646 | -0.339 | -0.099 |
| -1.845000000000067 | -0.649 | -0.341 | -0.1 |
| -1.840000000000067 | -0.653 | -0.343 | -0.101 |
| -1.835000000000067 | -0.656 | -0.345 | -0.102 |
| -1.830000000000068 | -0.659 | -0.347 | -0.103 |
| -1.825000000000068 | -0.663 | -0.349 | -0.104 |
| -1.820000000000068 | -0.666 | -0.351 | -0.105 |
| -1.815000000000068 | -0.67 | -0.353 | -0.106 |
| -1.810000000000068 | -0.673 | -0.355 | -0.107 |
| -1.805000000000068 | -0.676 | -0.357 | -0.108 |
| -1.800000000000068 | -0.68 | -0.359 | -0.11 |
| -1.795000000000068 | -0.684 | -0.361 | -0.111 |
| -1.790000000000068 | -0.687 | -0.363 | -0.112 |
| -1.785000000000068 | -0.691 | -0.365 | -0.113 |
| -1.780000000000069 | -0.694 | -0.367 | -0.114 |
| -1.775000000000069 | -0.698 | -0.37 | -0.115 |
| -1.770000000000069 | -0.702 | -0.372 | -0.116 |
| -1.765000000000069 | -0.705 | -0.374 | -0.118 |
| -1.760000000000069 | -0.709 | -0.376 | -0.119 |
| -1.75500000000007 | -0.713 | -0.378 | -0.12 |
| -1.75000000000007 | -0.717 | -0.381 | -0.121 |
| -1.745000000000069 | -0.721 | -0.383 | -0.122 |
| -1.740000000000069 | -0.724 | -0.385 | -0.124 |
| -1.73500000000007 | -0.728 | -0.388 | -0.125 |
| -1.73000000000007 | -0.732 | -0.39 | -0.126 |
| -1.72500000000007 | -0.736 | -0.392 | -0.127 |
| -1.72000000000007 | -0.74 | -0.395 | -0.129 |
| -1.71500000000007 | -0.744 | -0.397 | -0.13 |
| -1.71000000000007 | -0.748 | -0.399 | -0.131 |
| -1.70500000000007 | -0.753 | -0.402 | -0.133 |
| -1.70000000000007 | -0.757 | -0.404 | -0.134 |
| -1.69500000000007 | -0.761 | -0.407 | -0.135 |
| -1.69000000000007 | -0.765 | -0.409 | -0.137 |
| -1.685000000000071 | -0.769 | -0.411 | -0.138 |
| -1.680000000000071 | -0.774 | -0.414 | -0.139 |
| -1.675000000000071 | -0.778 | -0.416 | -0.141 |
| -1.670000000000071 | -0.782 | -0.419 | -0.142 |
| -1.665000000000071 | -0.787 | -0.422 | -0.144 |
| -1.660000000000071 | -0.791 | -0.424 | -0.145 |
| -1.655000000000071 | -0.796 | -0.427 | -0.147 |
| -1.650000000000071 | -0.8 | -0.429 | -0.148 |
| -1.645000000000071 | -0.805 | -0.432 | -0.15 |
| -1.640000000000072 | -0.809 | -0.435 | -0.151 |
| -1.635000000000072 | -0.814 | -0.437 | -0.153 |
| -1.630000000000072 | -0.819 | -0.44 | -0.154 |
| -1.625000000000072 | -0.824 | -0.443 | -0.156 |
| -1.620000000000072 | -0.828 | -0.446 | -0.157 |
| -1.615000000000072 | -0.833 | -0.448 | -0.159 |
| -1.610000000000072 | -0.838 | -0.451 | -0.161 |
| -1.605000000000072 | -0.843 | -0.454 | -0.162 |
| -1.600000000000072 | -0.848 | -0.457 | -0.164 |
| -1.595000000000073 | -0.853 | -0.46 | -0.166 |
| -1.590000000000073 | -0.858 | -0.462 | -0.167 |
| -1.585000000000073 | -0.863 | -0.465 | -0.169 |
| -1.580000000000073 | -0.868 | -0.468 | -0.171 |
| -1.575000000000073 | -0.873 | -0.471 | -0.172 |
| -1.570000000000073 | -0.879 | -0.474 | -0.174 |
| -1.565000000000073 | -0.884 | -0.477 | -0.176 |
| -1.560000000000073 | -0.889 | -0.48 | -0.178 |
| -1.555000000000073 | -0.895 | -0.483 | -0.179 |
| -1.550000000000074 | -0.9 | -0.486 | -0.181 |
| -1.545000000000074 | -0.905 | -0.49 | -0.183 |
| -1.540000000000074 | -0.911 | -0.493 | -0.185 |
| -1.535000000000074 | -0.917 | -0.496 | -0.187 |
| -1.530000000000074 | -0.922 | -0.499 | -0.189 |
| -1.525000000000074 | -0.928 | -0.502 | -0.191 |
| -1.520000000000074 | -0.934 | -0.506 | -0.193 |
| -1.515000000000074 | -0.94 | -0.509 | -0.195 |
| -1.510000000000074 | -0.945 | -0.512 | -0.197 |
| -1.505000000000074 | -0.951 | -0.515 | -0.199 |
| -1.500000000000075 | -0.957 | -0.519 | -0.201 |
| -1.495000000000075 | -0.963 | -0.522 | -0.203 |
| -1.490000000000075 | -0.969 | -0.526 | -0.205 |
| -1.485000000000075 | -0.976 | -0.529 | -0.207 |
| -1.480000000000075 | -0.982 | -0.533 | -0.209 |
| -1.475000000000075 | -0.988 | -0.536 | -0.211 |
| -1.470000000000075 | -0.995 | -0.54 | -0.213 |
| -1.465000000000075 | -1.001 | -0.543 | -0.215 |
| -1.460000000000075 | -1.007 | -0.547 | -0.218 |
| -1.455000000000076 | -1.014 | -0.551 | -0.22 |
| -1.450000000000076 | -1.021 | -0.554 | -0.222 |
| -1.445000000000076 | -1.027 | -0.558 | -0.224 |
| -1.440000000000076 | -1.034 | -0.562 | -0.227 |
| -1.435000000000076 | -1.041 | -0.566 | -0.229 |
| -1.430000000000076 | -1.048 | -0.569 | -0.231 |
| -1.425000000000076 | -1.055 | -0.573 | -0.234 |
| -1.420000000000076 | -1.062 | -0.577 | -0.236 |
| -1.415000000000076 | -1.069 | -0.581 | -0.239 |
| -1.410000000000077 | -1.076 | -0.585 | -0.241 |
| -1.405000000000077 | -1.083 | -0.589 | -0.243 |
| -1.400000000000077 | -1.091 | -0.593 | -0.246 |
| -1.395000000000077 | -1.098 | -0.597 | -0.248 |
| -1.390000000000077 | -1.106 | -0.601 | -0.251 |
| -1.385000000000077 | -1.113 | -0.606 | -0.254 |
| -1.380000000000077 | -1.121 | -0.61 | -0.256 |
| -1.375000000000077 | -1.128 | -0.614 | -0.259 |
| -1.370000000000077 | -1.136 | -0.618 | -0.262 |
| -1.365000000000077 | -1.144 | -0.623 | -0.264 |
| -1.360000000000078 | -1.152 | -0.627 | -0.267 |
| -1.355000000000078 | -1.16 | -0.631 | -0.27 |
| -1.350000000000078 | -1.168 | -0.636 | -0.272 |
| -1.345000000000078 | -1.177 | -0.64 | -0.275 |
| -1.340000000000078 | -1.185 | -0.645 | -0.278 |
| -1.335000000000078 | -1.193 | -0.65 | -0.281 |
| -1.330000000000078 | -1.202 | -0.654 | -0.284 |
| -1.325000000000078 | -1.211 | -0.659 | -0.287 |
| -1.320000000000078 | -1.219 | -0.664 | -0.29 |
| -1.315000000000079 | -1.228 | -0.669 | -0.293 |
| -1.310000000000079 | -1.237 | -0.673 | -0.296 |
| -1.305000000000079 | -1.246 | -0.678 | -0.299 |
| -1.300000000000079 | -1.255 | -0.683 | -0.302 |
| -1.295000000000079 | -1.265 | -0.688 | -0.305 |
| -1.29000000000008 | -1.274 | -0.693 | -0.308 |
| -1.285000000000079 | -1.283 | -0.698 | -0.312 |
| -1.280000000000079 | -1.293 | -0.704 | -0.315 |
| -1.275000000000079 | -1.303 | -0.709 | -0.318 |
| -1.270000000000079 | -1.312 | -0.714 | -0.321 |
| -1.26500000000008 | -1.322 | -0.72 | -0.325 |
| -1.26000000000008 | -1.332 | -0.725 | -0.328 |
| -1.25500000000008 | -1.342 | -0.73 | -0.332 |
| -1.25000000000008 | -1.353 | -0.736 | -0.335 |
| -1.24500000000008 | -1.363 | -0.741 | -0.339 |
| -1.24000000000008 | -1.374 | -0.747 | -0.342 |
| -1.23500000000008 | -1.384 | -0.753 | -0.346 |
| -1.23000000000008 | -1.395 | -0.759 | -0.349 |
| -1.22500000000008 | -1.406 | -0.764 | -0.353 |
| -1.220000000000081 | -1.417 | -0.77 | -0.357 |
| -1.215000000000081 | -1.428 | -0.776 | -0.36 |
| -1.210000000000081 | -1.439 | -0.782 | -0.364 |
| -1.205000000000081 | -1.451 | -0.788 | -0.368 |
| -1.200000000000081 | -1.462 | -0.795 | -0.372 |
| -1.195000000000081 | -1.474 | -0.801 | -0.376 |
| -1.190000000000081 | -1.486 | -0.807 | -0.38 |
| -1.185000000000081 | -1.498 | -0.814 | -0.384 |
| -1.180000000000081 | -1.51 | -0.82 | -0.388 |
| -1.175000000000082 | -1.522 | -0.827 | -0.392 |
| -1.170000000000082 | -1.535 | -0.833 | -0.396 |
| -1.165000000000082 | -1.548 | -0.84 | -0.4 |
| -1.160000000000082 | -1.56 | -0.847 | -0.405 |
| -1.155000000000082 | -1.573 | -0.854 | -0.409 |
| -1.150000000000082 | -1.587 | -0.861 | -0.413 |
| -1.145000000000082 | -1.6 | -0.868 | -0.418 |
| -1.140000000000082 | -1.613 | -0.875 | -0.422 |
| -1.135000000000082 | -1.627 | -0.882 | -0.427 |
| -1.130000000000082 | -1.641 | -0.889 | -0.431 |
| -1.125000000000083 | -1.655 | -0.897 | -0.436 |
| -1.120000000000083 | -1.669 | -0.904 | -0.441 |
| -1.115000000000083 | -1.683 | -0.912 | -0.445 |
| -1.110000000000083 | -1.698 | -0.92 | -0.45 |
| -1.105000000000083 | -1.713 | -0.927 | -0.455 |
| -1.100000000000083 | -1.728 | -0.935 | -0.46 |
| -1.095000000000083 | -1.743 | -0.943 | -0.465 |
| -1.090000000000083 | -1.758 | -0.951 | -0.47 |
| -1.085000000000083 | -1.774 | -0.96 | -0.475 |
| -1.080000000000084 | -1.79 | -0.968 | -0.48 |
| -1.075000000000084 | -1.806 | -0.976 | -0.485 |
| -1.070000000000084 | -1.822 | -0.985 | -0.491 |
| -1.065000000000084 | -1.839 | -0.993 | -0.496 |
| -1.060000000000084 | -1.856 | -1.002 | -0.501 |
| -1.055000000000084 | -1.873 | -1.011 | -0.507 |
| -1.050000000000084 | -1.89 | -1.02 | -0.512 |
| -1.045000000000084 | -1.907 | -1.029 | -0.518 |
| -1.040000000000084 | -1.925 | -1.038 | -0.524 |
| -1.035000000000085 | -1.943 | -1.048 | -0.53 |
| -1.030000000000085 | -1.961 | -1.057 | -0.535 |
| -1.025000000000085 | -1.98 | -1.067 | -0.541 |
| -1.020000000000085 | -1.998 | -1.077 | -0.547 |
| -1.015000000000085 | -2.017 | -1.087 | -0.553 |
| -1.010000000000085 | -2.037 | -1.097 | -0.559 |
| -1.005000000000085 | -2.056 | -1.107 | -0.566 |
| -1.000000000000085 | -2.076 | -1.117 | -0.572 |
| -0.995000000000085 | -2.097 | -1.128 | -0.578 |
| -0.990000000000085 | -2.117 | -1.138 | -0.585 |
| -0.985000000000085 | -2.138 | -1.149 | -0.591 |
| -0.980000000000085 | -2.159 | -1.16 | -0.598 |
| -0.975000000000085 | -2.181 | -1.171 | -0.605 |
| -0.970000000000085 | -2.202 | -1.183 | -0.612 |
| -0.965000000000085 | -2.225 | -1.194 | -0.619 |
| -0.960000000000085 | -2.247 | -1.206 | -0.626 |
| -0.955000000000085 | -2.27 | -1.217 | -0.633 |
| -0.950000000000085 | -2.293 | -1.229 | -0.64 |
| -0.945000000000085 | -2.317 | -1.242 | -0.647 |
| -0.940000000000085 | -2.341 | -1.254 | -0.655 |
| -0.935000000000085 | -2.365 | -1.266 | -0.662 |
| -0.930000000000085 | -2.39 | -1.279 | -0.67 |
| -0.925000000000085 | -2.415 | -1.292 | -0.678 |
| -0.920000000000085 | -2.44 | -1.305 | -0.685 |
| -0.915000000000085 | -2.466 | -1.319 | -0.693 |
| -0.910000000000085 | -2.493 | -1.332 | -0.701 |
| -0.905000000000085 | -2.519 | -1.346 | -0.71 |
| -0.900000000000085 | -2.547 | -1.36 | -0.718 |
| -0.895000000000085 | -2.574 | -1.374 | -0.726 |
| -0.890000000000085 | -2.603 | -1.389 | -0.735 |
| -0.885000000000085 | -2.631 | -1.403 | -0.744 |
| -0.880000000000085 | -2.661 | -1.418 | -0.752 |
| -0.875000000000085 | -2.69 | -1.434 | -0.761 |
| -0.870000000000085 | -2.72 | -1.449 | -0.77 |
| -0.865000000000085 | -2.751 | -1.465 | -0.78 |
| -0.860000000000085 | -2.782 | -1.481 | -0.789 |
| -0.855000000000085 | -2.814 | -1.497 | -0.799 |
| -0.850000000000085 | -2.846 | -1.513 | -0.808 |
| -0.845000000000085 | -2.879 | -1.53 | -0.818 |
| -0.840000000000085 | -2.913 | -1.547 | -0.828 |
| -0.835000000000085 | -2.947 | -1.565 | -0.838 |
| -0.830000000000085 | -2.982 | -1.582 | -0.848 |
| -0.825000000000085 | -3.017 | -1.601 | -0.859 |
| -0.820000000000085 | -3.053 | -1.619 | -0.869 |
| -0.815000000000085 | -3.09 | -1.638 | -0.88 |
| -0.810000000000085 | -3.127 | -1.657 | -0.891 |
| -0.805000000000085 | -3.165 | -1.676 | -0.902 |
| -0.800000000000085 | -3.204 | -1.696 | -0.913 |
| -0.795000000000085 | -3.243 | -1.716 | -0.925 |
| -0.790000000000085 | -3.284 | -1.736 | -0.937 |
| -0.785000000000085 | -3.325 | -1.757 | -0.949 |
| -0.780000000000085 | -3.366 | -1.778 | -0.961 |
| -0.775000000000085 | -3.409 | -1.8 | -0.973 |
| -0.770000000000085 | -3.452 | -1.822 | -0.985 |
| -0.765000000000085 | -3.497 | -1.845 | -0.998 |
| -0.760000000000085 | -3.542 | -1.867 | -1.011 |
| -0.755000000000085 | -3.588 | -1.891 | -1.024 |
| -0.750000000000085 | -3.635 | -1.915 | -1.038 |
| -0.745000000000085 | -3.683 | -1.939 | -1.051 |
| -0.740000000000085 | -3.732 | -1.964 | -1.065 |
| -0.735000000000085 | -3.782 | -1.989 | -1.079 |
| -0.730000000000085 | -3.833 | -2.015 | -1.094 |
| -0.725000000000085 | -3.885 | -2.041 | -1.109 |
| -0.720000000000085 | -3.938 | -2.068 | -1.124 |
| -0.715000000000085 | -3.992 | -2.095 | -1.139 |
| -0.710000000000085 | -4.047 | -2.123 | -1.154 |
| -0.705000000000085 | -4.104 | -2.152 | -1.17 |
| -0.700000000000085 | -4.161 | -2.181 | -1.186 |
| -0.695000000000085 | -4.22 | -2.211 | -1.203 |
| -0.690000000000085 | -4.281 | -2.241 | -1.219 |
| -0.685000000000085 | -4.342 | -2.273 | -1.237 |
| -0.680000000000085 | -4.405 | -2.304 | -1.254 |
| -0.675000000000085 | -4.47 | -2.337 | -1.272 |
| -0.670000000000085 | -4.535 | -2.37 | -1.29 |
| -0.665000000000085 | -4.603 | -2.404 | -1.309 |
| -0.660000000000085 | -4.672 | -2.439 | -1.327 |
| -0.655000000000085 | -4.742 | -2.474 | -1.347 |
| -0.650000000000085 | -4.814 | -2.511 | -1.367 |
| -0.645000000000085 | -4.888 | -2.548 | -1.387 |
| -0.640000000000085 | -4.963 | -2.586 | -1.407 |
| -0.635000000000085 | -5.04 | -2.625 | -1.428 |
| -0.630000000000085 | -5.12 | -2.665 | -1.45 |
| -0.625000000000085 | -5.201 | -2.705 | -1.472 |
| -0.620000000000085 | -5.283 | -2.747 | -1.494 |
| -0.615000000000085 | -5.368 | -2.79 | -1.517 |
| -0.610000000000085 | -5.456 | -2.834 | -1.541 |
| -0.605000000000085 | -5.545 | -2.879 | -1.565 |
| -0.600000000000085 | -5.636 | -2.925 | -1.589 |
| -0.595000000000085 | -5.73 | -2.972 | -1.615 |
| -0.590000000000085 | -5.826 | -3.02 | -1.64 |
| -0.585000000000085 | -5.925 | -3.07 | -1.667 |
| -0.580000000000085 | -6.026 | -3.121 | -1.694 |
| -0.575000000000085 | -6.13 | -3.173 | -1.721 |
| -0.570000000000085 | -6.237 | -3.227 | -1.75 |
| -0.565000000000085 | -6.346 | -3.282 | -1.779 |
| -0.560000000000085 | -6.459 | -3.338 | -1.809 |
| -0.555000000000085 | -6.574 | -3.396 | -1.839 |
| -0.550000000000085 | -6.693 | -3.456 | -1.871 |
| -0.545000000000085 | -6.815 | -3.517 | -1.903 |
| -0.540000000000085 | -6.94 | -3.58 | -1.936 |
| -0.535000000000085 | -7.069 | -3.645 | -1.97 |
| -0.530000000000085 | -7.201 | -3.711 | -2.004 |
| -0.525000000000085 | -7.338 | -3.779 | -2.04 |
| -0.520000000000085 | -7.478 | -3.85 | -2.077 |
| -0.515000000000085 | -7.622 | -3.922 | -2.115 |
| -0.510000000000085 | -7.771 | -3.997 | -2.154 |
| -0.505000000000085 | -7.924 | -4.074 | -2.193 |
| -0.500000000000085 | -8.082 | -4.153 | -2.235 |
| -0.495000000000085 | -8.244 | -4.234 | -2.277 |
| -0.490000000000085 | -8.411 | -4.318 | -2.32 |
| -0.485000000000085 | -8.584 | -4.405 | -2.365 |
| -0.480000000000085 | -8.762 | -4.494 | -2.411 |
| -0.475000000000085 | -8.946 | -4.586 | -2.459 |
| -0.470000000000085 | -9.136 | -4.681 | -2.508 |
| -0.465000000000085 | -9.331 | -4.779 | -2.558 |
| -0.460000000000085 | -9.534 | -4.881 | -2.611 |
| -0.455000000000085 | -9.743 | -4.985 | -2.664 |
| -0.450000000000085 | -9.958 | -5.094 | -2.72 |
| -0.445000000000085 | -10.182 | -5.205 | -2.777 |
| -0.440000000000085 | -10.413 | -5.321 | -2.837 |
| -0.435000000000085 | -10.651 | -5.441 | -2.898 |
| -0.430000000000085 | -10.899 | -5.565 | -2.961 |
| -0.425000000000085 | -11.155 | -5.693 | -3.027 |
| -0.420000000000085 | -11.42 | -5.826 | -3.095 |
| -0.415000000000085 | -11.695 | -5.963 | -3.165 |
| -0.410000000000085 | -11.98 | -6.106 | -3.238 |
| -0.405000000000085 | -12.275 | -6.254 | -3.313 |
| -0.400000000000085 | -12.582 | -6.408 | -3.391 |
| -0.395000000000085 | -12.901 | -6.567 | -3.472 |
| -0.390000000000085 | -13.231 | -6.733 | -3.557 |
| -0.385000000000085 | -13.575 | -6.905 | -3.644 |
| -0.380000000000085 | -13.933 | -7.084 | -3.735 |
| -0.375000000000085 | -14.305 | -7.27 | -3.829 |
| -0.370000000000085 | -14.692 | -7.463 | -3.927 |
| -0.365000000000085 | -15.095 | -7.665 | -4.03 |
| -0.360000000000085 | -15.514 | -7.875 | -4.136 |
| -0.355000000000085 | -15.952 | -8.094 | -4.247 |
| -0.350000000000085 | -16.409 | -8.323 | -4.362 |
| -0.345000000000085 | -16.886 | -8.561 | -4.483 |
| -0.340000000000085 | -17.384 | -8.811 | -4.609 |
| -0.335000000000085 | -17.904 | -9.071 | -4.74 |
| -0.330000000000085 | -18.448 | -9.343 | -4.878 |
| -0.325000000000085 | -19.017 | -9.628 | -5.021 |
| -0.320000000000085 | -19.614 | -9.926 | -5.172 |
| -0.315000000000085 | -20.239 | -10.239 | -5.329 |
| -0.310000000000085 | -20.894 | -10.567 | -5.494 |
| -0.305000000000085 | -21.582 | -10.911 | -5.668 |
| -0.300000000000085 | -22.305 | -11.273 | -5.849 |
| -0.295000000000085 | -23.065 | -11.653 | -6.041 |
| -0.290000000000085 | -23.864 | -12.052 | -6.242 |
| -0.285000000000085 | -24.706 | -12.473 | -6.453 |
| -0.280000000000085 | -25.593 | -12.917 | -6.676 |
| -0.275000000000085 | -26.529 | -13.385 | -6.911 |
| -0.270000000000085 | -27.518 | -13.88 | -7.16 |
| -0.265000000000085 | -28.563 | -14.403 | -7.422 |
| -0.260000000000085 | -29.669 | -14.956 | -7.7 |
| -0.255000000000085 | -30.84 | -15.542 | -7.994 |
| -0.250000000000085 | -32.083 | -16.163 | -8.305 |
| -0.245000000000085 | -33.402 | -16.823 | -8.636 |
| -0.240000000000085 | -34.805 | -17.524 | -8.988 |
| -0.235000000000085 | -36.298 | -18.271 | -9.362 |
| -0.230000000000085 | -37.89 | -19.067 | -9.761 |
| -0.225000000000085 | -39.589 | -19.917 | -10.187 |
| -0.220000000000085 | -41.405 | -20.825 | -10.642 |
| -0.215000000000085 | -43.35 | -21.797 | -11.129 |
| -0.210000000000085 | -45.434 | -22.84 | -11.651 |
| -0.205000000000085 | -47.674 | -23.96 | -12.212 |
| -0.200000000000085 | -50.083 | -25.164 | -12.815 |
| -0.195000000000085 | -52.68 | -26.463 | -13.465 |
| -0.190000000000085 | -55.485 | -27.865 | -14.167 |
| -0.185000000000085 | -58.52 | -29.383 | -14.927 |
| -0.180000000000085 | -61.811 | -31.029 | -15.751 |
| -0.175000000000085 | -65.389 | -32.818 | -16.646 |
| -0.170000000000085 | -69.287 | -34.767 | -17.621 |
| -0.165000000000085 | -73.545 | -36.896 | -18.686 |
| -0.160000000000085 | -78.208 | -39.228 | -19.853 |
| -0.155000000000084 | -83.33 | -41.789 | -21.134 |
| -0.150000000000084 | -88.972 | -44.61 | -22.545 |
| -0.145000000000084 | -95.208 | -47.728 | -24.105 |
| -0.140000000000084 | -102.124 | -51.186 | -25.835 |
| -0.135000000000084 | -109.823 | -55.035 | -27.76 |
| -0.130000000000084 | -118.426 | -59.337 | -29.911 |
| -0.125000000000084 | -128.083 | -64.166 | -32.326 |
| -0.120000000000084 | -138.972 | -69.61 | -35.049 |
| -0.115000000000084 | -151.312 | -75.78 | -38.134 |
| -0.110000000000084 | -165.373 | -82.811 | -41.65 |
| -0.105000000000084 | -181.489 | -90.869 | -45.68 |
| -0.100000000000084 | -200.083 | -100.166 | -50.329 |
| -0.0950000000000844 | -221.69 | -110.969 | -55.731 |
| -0.0900000000000844 | -246.997 | -123.623 | -62.058 |
| -0.0850000000000844 | -276.9 | -138.575 | -69.534 |
| -0.0800000000000844 | -312.583 | -156.416 | -78.455 |
| -0.0750000000000844 | -355.639 | -177.944 | -89.22 |
| -0.0700000000000844 | -408.247 | -204.248 | -102.372 |
| -0.0650000000000844 | -473.456 | -236.853 | -118.675 |
| -0.0600000000000844 | -555.639 | -277.944 | -139.221 |
| -0.0550000000000844 | -661.24 | -330.745 | -165.621 |
| -0.0500000000000844 | -800.083 | -400.167 | -200.332 |
| -0.0450000000000844 | -987.738 | -493.994 | -247.246 |
| -0.0400000000000844 | -1250.083 | -625.167 | -312.833 |
| -0.0350000000000844 | -1632.736 | -816.493 | -408.496 |
| -0.0300000000000844 | -2222.306 | -1111.278 | -555.888 |
| -0.0250000000000844 | -3200.083 | -1600.167 | -800.333 |
| -0.0200000000000844 | -5000.083 | -2500.167 | -1250.333 |
| -0.0150000000000844 | -8888.972 | -4444.611 | -2222.555 |
| -0.0100000000000844 | -20000.083 | -10000.167 | -5000.333 |
| -0.00500000000008444 | -80000.083 | -40000.167 | -20000.333 |
| -8.4444604087075e-14 | -280919800604594001942675456 | -140275266868023000341413888 | -70091543319643096034050048 |
| 0.00499999999991555 | -80000.083 | -40000.167 | -20000.333 |
| 0.00999999999991555 | -20000.083 | -10000.167 | -5000.333 |
| 0.0149999999999156 | -8888.972 | -4444.611 | -2222.555 |
| 0.0199999999999156 | -5000.083 | -2500.167 | -1250.333 |
| 0.0249999999999156 | -3200.083 | -1600.167 | -800.333 |
| 0.0299999999999156 | -2222.306 | -1111.278 | -555.888 |
| 0.0349999999999155 | -1632.736 | -816.493 | -408.496 |
| 0.0399999999999155 | -1250.083 | -625.167 | -312.833 |
| 0.0449999999999155 | -987.738 | -493.994 | -247.246 |
| 0.0499999999999155 | -800.083 | -400.167 | -200.332 |
| 0.0549999999999155 | -661.24 | -330.745 | -165.621 |
| 0.0599999999999155 | -555.639 | -277.944 | -139.221 |
| 0.0649999999999155 | -473.456 | -236.853 | -118.675 |
| 0.0699999999999155 | -408.247 | -204.248 | -102.372 |
| 0.0749999999999155 | -355.639 | -177.944 | -89.22 |
| 0.0799999999999155 | -312.583 | -156.416 | -78.455 |
| 0.0849999999999155 | -276.9 | -138.575 | -69.534 |
| 0.0899999999999155 | -246.997 | -123.623 | -62.058 |
| 0.0949999999999155 | -221.69 | -110.969 | -55.731 |
| 0.0999999999999155 | -200.083 | -100.166 | -50.329 |
| 0.104999999999916 | -181.489 | -90.869 | -45.68 |
| 0.109999999999916 | -165.373 | -82.811 | -41.65 |
| 0.114999999999916 | -151.312 | -75.78 | -38.134 |
| 0.119999999999916 | -138.972 | -69.61 | -35.049 |
| 0.124999999999916 | -128.083 | -64.166 | -32.326 |
| 0.129999999999916 | -118.426 | -59.337 | -29.911 |
| 0.134999999999916 | -109.823 | -55.035 | -27.76 |
| 0.139999999999916 | -102.124 | -51.186 | -25.835 |
| 0.144999999999916 | -95.208 | -47.728 | -24.105 |
| 0.149999999999916 | -88.972 | -44.61 | -22.545 |
| 0.154999999999916 | -83.33 | -41.789 | -21.134 |
| 0.159999999999916 | -78.208 | -39.228 | -19.853 |
| 0.164999999999916 | -73.545 | -36.896 | -18.686 |
| 0.169999999999916 | -69.287 | -34.767 | -17.621 |
| 0.174999999999916 | -65.389 | -32.818 | -16.646 |
| 0.179999999999916 | -61.811 | -31.029 | -15.751 |
| 0.184999999999916 | -58.52 | -29.383 | -14.927 |
| 0.189999999999916 | -55.485 | -27.865 | -14.167 |
| 0.194999999999916 | -52.68 | -26.463 | -13.465 |
| 0.199999999999916 | -50.083 | -25.164 | -12.815 |
| 0.204999999999916 | -47.674 | -23.96 | -12.212 |
| 0.209999999999916 | -45.434 | -22.84 | -11.651 |
| 0.214999999999916 | -43.35 | -21.797 | -11.129 |
| 0.219999999999916 | -41.405 | -20.825 | -10.642 |
| 0.224999999999916 | -39.589 | -19.917 | -10.187 |
| 0.229999999999916 | -37.89 | -19.067 | -9.761 |
| 0.234999999999916 | -36.298 | -18.271 | -9.362 |
| 0.239999999999916 | -34.805 | -17.524 | -8.988 |
| 0.244999999999916 | -33.402 | -16.823 | -8.636 |
| 0.249999999999916 | -32.083 | -16.163 | -8.305 |
| 0.254999999999916 | -30.84 | -15.542 | -7.994 |
| 0.259999999999916 | -29.669 | -14.956 | -7.7 |
| 0.264999999999916 | -28.563 | -14.403 | -7.422 |
| 0.269999999999916 | -27.518 | -13.88 | -7.16 |
| 0.274999999999916 | -26.529 | -13.385 | -6.911 |
| 0.279999999999916 | -25.593 | -12.917 | -6.676 |
| 0.284999999999916 | -24.706 | -12.473 | -6.453 |
| 0.289999999999916 | -23.864 | -12.052 | -6.242 |
| 0.294999999999916 | -23.065 | -11.653 | -6.041 |
| 0.299999999999916 | -22.305 | -11.273 | -5.849 |
| 0.304999999999916 | -21.582 | -10.911 | -5.668 |
| 0.309999999999916 | -20.894 | -10.567 | -5.494 |
| 0.314999999999916 | -20.239 | -10.239 | -5.329 |
| 0.319999999999916 | -19.614 | -9.926 | -5.172 |
| 0.324999999999916 | -19.017 | -9.628 | -5.021 |
| 0.329999999999916 | -18.448 | -9.343 | -4.878 |
| 0.334999999999916 | -17.904 | -9.071 | -4.74 |
| 0.339999999999916 | -17.384 | -8.811 | -4.609 |
| 0.344999999999916 | -16.886 | -8.561 | -4.483 |
| 0.349999999999916 | -16.409 | -8.323 | -4.362 |
| 0.354999999999916 | -15.952 | -8.094 | -4.247 |
| 0.359999999999916 | -15.514 | -7.875 | -4.136 |
| 0.364999999999916 | -15.095 | -7.665 | -4.03 |
| 0.369999999999916 | -14.692 | -7.463 | -3.927 |
| 0.374999999999916 | -14.305 | -7.27 | -3.829 |
| 0.379999999999916 | -13.933 | -7.084 | -3.735 |
| 0.384999999999916 | -13.575 | -6.905 | -3.644 |
| 0.389999999999916 | -13.231 | -6.733 | -3.557 |
| 0.394999999999916 | -12.901 | -6.567 | -3.472 |
| 0.399999999999916 | -12.582 | -6.408 | -3.391 |
| 0.404999999999916 | -12.275 | -6.254 | -3.313 |
| 0.409999999999916 | -11.98 | -6.106 | -3.238 |
| 0.414999999999916 | -11.695 | -5.963 | -3.165 |
| 0.419999999999916 | -11.42 | -5.826 | -3.095 |
| 0.424999999999916 | -11.155 | -5.693 | -3.027 |
| 0.429999999999916 | -10.899 | -5.565 | -2.961 |
| 0.434999999999916 | -10.651 | -5.441 | -2.898 |
| 0.439999999999916 | -10.413 | -5.321 | -2.837 |
| 0.444999999999916 | -10.182 | -5.205 | -2.777 |
| 0.449999999999916 | -9.958 | -5.094 | -2.72 |
| 0.454999999999916 | -9.743 | -4.985 | -2.664 |
| 0.459999999999916 | -9.534 | -4.881 | -2.611 |
| 0.464999999999916 | -9.331 | -4.779 | -2.558 |
| 0.469999999999916 | -9.136 | -4.681 | -2.508 |
| 0.474999999999916 | -8.946 | -4.586 | -2.459 |
| 0.479999999999916 | -8.762 | -4.494 | -2.411 |
| 0.484999999999916 | -8.584 | -4.405 | -2.365 |
| 0.489999999999916 | -8.411 | -4.318 | -2.32 |
| 0.494999999999916 | -8.244 | -4.234 | -2.277 |
| 0.499999999999916 | -8.082 | -4.153 | -2.235 |
| 0.504999999999916 | -7.924 | -4.074 | -2.193 |
| 0.509999999999916 | -7.771 | -3.997 | -2.154 |
| 0.514999999999916 | -7.622 | -3.922 | -2.115 |
| 0.519999999999916 | -7.478 | -3.85 | -2.077 |
| 0.524999999999916 | -7.338 | -3.779 | -2.04 |
| 0.529999999999916 | -7.201 | -3.711 | -2.004 |
| 0.534999999999916 | -7.069 | -3.645 | -1.97 |
| 0.539999999999916 | -6.94 | -3.58 | -1.936 |
| 0.544999999999916 | -6.815 | -3.517 | -1.903 |
| 0.549999999999916 | -6.693 | -3.456 | -1.871 |
| 0.554999999999916 | -6.574 | -3.396 | -1.839 |
| 0.559999999999916 | -6.459 | -3.338 | -1.809 |
| 0.564999999999916 | -6.346 | -3.282 | -1.779 |
| 0.569999999999916 | -6.237 | -3.227 | -1.75 |
| 0.574999999999916 | -6.13 | -3.173 | -1.721 |
| 0.579999999999916 | -6.026 | -3.121 | -1.694 |
| 0.584999999999916 | -5.925 | -3.07 | -1.667 |
| 0.589999999999916 | -5.826 | -3.02 | -1.64 |
| 0.594999999999916 | -5.73 | -2.972 | -1.615 |
| 0.599999999999916 | -5.636 | -2.925 | -1.589 |
| 0.604999999999916 | -5.545 | -2.879 | -1.565 |
| 0.609999999999916 | -5.456 | -2.834 | -1.541 |
| 0.614999999999916 | -5.368 | -2.79 | -1.517 |
| 0.619999999999916 | -5.283 | -2.747 | -1.494 |
| 0.624999999999916 | -5.201 | -2.705 | -1.472 |
| 0.629999999999916 | -5.12 | -2.665 | -1.45 |
| 0.634999999999916 | -5.04 | -2.625 | -1.428 |
| 0.639999999999916 | -4.963 | -2.586 | -1.407 |
| 0.644999999999916 | -4.888 | -2.548 | -1.387 |
| 0.649999999999916 | -4.814 | -2.511 | -1.367 |
| 0.654999999999916 | -4.742 | -2.474 | -1.347 |
| 0.659999999999916 | -4.672 | -2.439 | -1.327 |
| 0.664999999999916 | -4.603 | -2.404 | -1.309 |
| 0.669999999999916 | -4.535 | -2.37 | -1.29 |
| 0.674999999999916 | -4.47 | -2.337 | -1.272 |
| 0.679999999999916 | -4.405 | -2.304 | -1.254 |
| 0.684999999999916 | -4.342 | -2.273 | -1.237 |
| 0.689999999999916 | -4.281 | -2.241 | -1.219 |
| 0.694999999999916 | -4.22 | -2.211 | -1.203 |
| 0.699999999999916 | -4.161 | -2.181 | -1.186 |
| 0.704999999999916 | -4.104 | -2.152 | -1.17 |
| 0.709999999999916 | -4.047 | -2.123 | -1.154 |
| 0.714999999999916 | -3.992 | -2.095 | -1.139 |
| 0.719999999999916 | -3.938 | -2.068 | -1.124 |
| 0.724999999999916 | -3.885 | -2.041 | -1.109 |
| 0.729999999999916 | -3.833 | -2.015 | -1.094 |
| 0.734999999999916 | -3.782 | -1.989 | -1.079 |
| 0.739999999999916 | -3.732 | -1.964 | -1.065 |
| 0.744999999999916 | -3.683 | -1.939 | -1.051 |
| 0.749999999999916 | -3.635 | -1.915 | -1.038 |
| 0.754999999999916 | -3.588 | -1.891 | -1.024 |
| 0.759999999999916 | -3.542 | -1.867 | -1.011 |
| 0.764999999999916 | -3.497 | -1.845 | -0.998 |
| 0.769999999999916 | -3.452 | -1.822 | -0.985 |
| 0.774999999999916 | -3.409 | -1.8 | -0.973 |
| 0.779999999999916 | -3.366 | -1.778 | -0.961 |
| 0.784999999999916 | -3.325 | -1.757 | -0.949 |
| 0.789999999999916 | -3.284 | -1.736 | -0.937 |
| 0.794999999999916 | -3.243 | -1.716 | -0.925 |
| 0.799999999999916 | -3.204 | -1.696 | -0.913 |
| 0.804999999999916 | -3.165 | -1.676 | -0.902 |
| 0.809999999999916 | -3.127 | -1.657 | -0.891 |
| 0.814999999999916 | -3.09 | -1.638 | -0.88 |
| 0.819999999999916 | -3.053 | -1.619 | -0.869 |
| 0.824999999999916 | -3.017 | -1.601 | -0.859 |
| 0.829999999999916 | -2.982 | -1.582 | -0.848 |
| 0.834999999999916 | -2.947 | -1.565 | -0.838 |
| 0.839999999999916 | -2.913 | -1.547 | -0.828 |
| 0.844999999999916 | -2.879 | -1.53 | -0.818 |
| 0.849999999999916 | -2.846 | -1.513 | -0.808 |
| 0.854999999999916 | -2.814 | -1.497 | -0.799 |
| 0.859999999999916 | -2.782 | -1.481 | -0.789 |
| 0.864999999999916 | -2.751 | -1.465 | -0.78 |
| 0.869999999999916 | -2.72 | -1.449 | -0.77 |
| 0.874999999999916 | -2.69 | -1.434 | -0.761 |
| 0.879999999999916 | -2.661 | -1.418 | -0.752 |
| 0.884999999999916 | -2.631 | -1.403 | -0.744 |
| 0.889999999999916 | -2.603 | -1.389 | -0.735 |
| 0.894999999999916 | -2.574 | -1.374 | -0.726 |
| 0.899999999999916 | -2.547 | -1.36 | -0.718 |
| 0.904999999999916 | -2.519 | -1.346 | -0.71 |
| 0.909999999999916 | -2.493 | -1.332 | -0.701 |
| 0.914999999999916 | -2.466 | -1.319 | -0.693 |
| 0.919999999999916 | -2.44 | -1.305 | -0.685 |
| 0.924999999999916 | -2.415 | -1.292 | -0.678 |
| 0.929999999999916 | -2.39 | -1.279 | -0.67 |
| 0.934999999999916 | -2.365 | -1.266 | -0.662 |
| 0.939999999999916 | -2.341 | -1.254 | -0.655 |
| 0.944999999999916 | -2.317 | -1.242 | -0.647 |
| 0.949999999999916 | -2.293 | -1.229 | -0.64 |
| 0.954999999999916 | -2.27 | -1.217 | -0.633 |
| 0.959999999999916 | -2.247 | -1.206 | -0.626 |
| 0.964999999999916 | -2.225 | -1.194 | -0.619 |
| 0.969999999999916 | -2.202 | -1.183 | -0.612 |
| 0.974999999999916 | -2.181 | -1.171 | -0.605 |
| 0.979999999999916 | -2.159 | -1.16 | -0.598 |
| 0.984999999999916 | -2.138 | -1.149 | -0.591 |
| 0.989999999999916 | -2.117 | -1.138 | -0.585 |
| 0.994999999999916 | -2.097 | -1.128 | -0.578 |
| 0.999999999999916 | -2.076 | -1.117 | -0.572 |
| 1.004999999999916 | -2.056 | -1.107 | -0.566 |
| 1.009999999999916 | -2.037 | -1.097 | -0.559 |
| 1.014999999999916 | -2.017 | -1.087 | -0.553 |
| 1.019999999999916 | -1.998 | -1.077 | -0.547 |
| 1.024999999999916 | -1.98 | -1.067 | -0.541 |
| 1.029999999999916 | -1.961 | -1.057 | -0.535 |
| 1.034999999999916 | -1.943 | -1.048 | -0.53 |
| 1.039999999999915 | -1.925 | -1.038 | -0.524 |
| 1.044999999999915 | -1.907 | -1.029 | -0.518 |
| 1.049999999999915 | -1.89 | -1.02 | -0.512 |
| 1.054999999999915 | -1.873 | -1.011 | -0.507 |
| 1.059999999999915 | -1.856 | -1.002 | -0.501 |
| 1.064999999999915 | -1.839 | -0.993 | -0.496 |
| 1.069999999999915 | -1.822 | -0.985 | -0.491 |
| 1.074999999999915 | -1.806 | -0.976 | -0.485 |
| 1.079999999999915 | -1.79 | -0.968 | -0.48 |
| 1.084999999999914 | -1.774 | -0.96 | -0.475 |
| 1.089999999999914 | -1.758 | -0.951 | -0.47 |
| 1.094999999999914 | -1.743 | -0.943 | -0.465 |
| 1.099999999999914 | -1.728 | -0.935 | -0.46 |
| 1.104999999999914 | -1.713 | -0.927 | -0.455 |
| 1.109999999999914 | -1.698 | -0.92 | -0.45 |
| 1.114999999999914 | -1.683 | -0.912 | -0.445 |
| 1.119999999999914 | -1.669 | -0.904 | -0.441 |
| 1.124999999999914 | -1.655 | -0.897 | -0.436 |
| 1.129999999999914 | -1.641 | -0.889 | -0.431 |
| 1.134999999999913 | -1.627 | -0.882 | -0.427 |
| 1.139999999999913 | -1.613 | -0.875 | -0.422 |
| 1.144999999999913 | -1.6 | -0.868 | -0.418 |
| 1.149999999999913 | -1.587 | -0.861 | -0.413 |
| 1.154999999999913 | -1.573 | -0.854 | -0.409 |
| 1.159999999999913 | -1.56 | -0.847 | -0.405 |
| 1.164999999999913 | -1.548 | -0.84 | -0.4 |
| 1.169999999999913 | -1.535 | -0.833 | -0.396 |
| 1.174999999999913 | -1.522 | -0.827 | -0.392 |
| 1.179999999999912 | -1.51 | -0.82 | -0.388 |
| 1.184999999999912 | -1.498 | -0.814 | -0.384 |
| 1.189999999999912 | -1.486 | -0.807 | -0.38 |
| 1.194999999999912 | -1.474 | -0.801 | -0.376 |
| 1.199999999999912 | -1.462 | -0.795 | -0.372 |
| 1.204999999999912 | -1.451 | -0.788 | -0.368 |
| 1.209999999999912 | -1.439 | -0.782 | -0.364 |
| 1.214999999999912 | -1.428 | -0.776 | -0.36 |
| 1.219999999999912 | -1.417 | -0.77 | -0.357 |
| 1.224999999999911 | -1.406 | -0.764 | -0.353 |
| 1.229999999999911 | -1.395 | -0.759 | -0.349 |
| 1.234999999999911 | -1.384 | -0.753 | -0.346 |
| 1.239999999999911 | -1.374 | -0.747 | -0.342 |
| 1.244999999999911 | -1.363 | -0.741 | -0.339 |
| 1.249999999999911 | -1.353 | -0.736 | -0.335 |
| 1.254999999999911 | -1.342 | -0.73 | -0.332 |
| 1.259999999999911 | -1.332 | -0.725 | -0.328 |
| 1.264999999999911 | -1.322 | -0.72 | -0.325 |
| 1.269999999999911 | -1.312 | -0.714 | -0.321 |
| 1.27499999999991 | -1.303 | -0.709 | -0.318 |
| 1.27999999999991 | -1.293 | -0.704 | -0.315 |
| 1.28499999999991 | -1.283 | -0.698 | -0.312 |
| 1.28999999999991 | -1.274 | -0.693 | -0.308 |
| 1.29499999999991 | -1.265 | -0.688 | -0.305 |
| 1.29999999999991 | -1.255 | -0.683 | -0.302 |
| 1.30499999999991 | -1.246 | -0.678 | -0.299 |
| 1.30999999999991 | -1.237 | -0.673 | -0.296 |
| 1.31499999999991 | -1.228 | -0.669 | -0.293 |
| 1.319999999999909 | -1.219 | -0.664 | -0.29 |
| 1.324999999999909 | -1.211 | -0.659 | -0.287 |
| 1.329999999999909 | -1.202 | -0.654 | -0.284 |
| 1.334999999999909 | -1.193 | -0.65 | -0.281 |
| 1.339999999999909 | -1.185 | -0.645 | -0.278 |
| 1.344999999999909 | -1.177 | -0.64 | -0.275 |
| 1.349999999999909 | -1.168 | -0.636 | -0.272 |
| 1.354999999999909 | -1.16 | -0.631 | -0.27 |
| 1.359999999999909 | -1.152 | -0.627 | -0.267 |
| 1.364999999999908 | -1.144 | -0.623 | -0.264 |
| 1.369999999999908 | -1.136 | -0.618 | -0.262 |
| 1.374999999999908 | -1.128 | -0.614 | -0.259 |
| 1.379999999999908 | -1.121 | -0.61 | -0.256 |
| 1.384999999999908 | -1.113 | -0.606 | -0.254 |
| 1.389999999999908 | -1.106 | -0.601 | -0.251 |
| 1.394999999999908 | -1.098 | -0.597 | -0.248 |
| 1.399999999999908 | -1.091 | -0.593 | -0.246 |
| 1.404999999999908 | -1.083 | -0.589 | -0.243 |
| 1.409999999999908 | -1.076 | -0.585 | -0.241 |
| 1.414999999999907 | -1.069 | -0.581 | -0.239 |
| 1.419999999999907 | -1.062 | -0.577 | -0.236 |
| 1.424999999999907 | -1.055 | -0.573 | -0.234 |
| 1.429999999999907 | -1.048 | -0.569 | -0.231 |
| 1.434999999999907 | -1.041 | -0.566 | -0.229 |
| 1.439999999999907 | -1.034 | -0.562 | -0.227 |
| 1.444999999999907 | -1.027 | -0.558 | -0.224 |
| 1.449999999999907 | -1.021 | -0.554 | -0.222 |
| 1.454999999999907 | -1.014 | -0.551 | -0.22 |
| 1.459999999999906 | -1.007 | -0.547 | -0.218 |
| 1.464999999999906 | -1.001 | -0.543 | -0.215 |
| 1.469999999999906 | -0.995 | -0.54 | -0.213 |
| 1.474999999999906 | -0.988 | -0.536 | -0.211 |
| 1.479999999999906 | -0.982 | -0.533 | -0.209 |
| 1.484999999999906 | -0.976 | -0.529 | -0.207 |
| 1.489999999999906 | -0.969 | -0.526 | -0.205 |
| 1.494999999999906 | -0.963 | -0.522 | -0.203 |
| 1.499999999999906 | -0.957 | -0.519 | -0.201 |
| 1.504999999999906 | -0.951 | -0.515 | -0.199 |
| 1.509999999999905 | -0.945 | -0.512 | -0.197 |
| 1.514999999999905 | -0.94 | -0.509 | -0.195 |
| 1.519999999999905 | -0.934 | -0.506 | -0.193 |
| 1.524999999999905 | -0.928 | -0.502 | -0.191 |
| 1.529999999999905 | -0.922 | -0.499 | -0.189 |
| 1.534999999999905 | -0.917 | -0.496 | -0.187 |
| 1.539999999999905 | -0.911 | -0.493 | -0.185 |
| 1.544999999999905 | -0.905 | -0.49 | -0.183 |
| 1.549999999999905 | -0.9 | -0.486 | -0.181 |
| 1.554999999999904 | -0.895 | -0.483 | -0.179 |
| 1.559999999999904 | -0.889 | -0.48 | -0.178 |
| 1.564999999999904 | -0.884 | -0.477 | -0.176 |
| 1.569999999999904 | -0.879 | -0.474 | -0.174 |
| 1.574999999999904 | -0.873 | -0.471 | -0.172 |
| 1.579999999999904 | -0.868 | -0.468 | -0.171 |
| 1.584999999999904 | -0.863 | -0.465 | -0.169 |
| 1.589999999999904 | -0.858 | -0.462 | -0.167 |
| 1.594999999999904 | -0.853 | -0.46 | -0.166 |
| 1.599999999999903 | -0.848 | -0.457 | -0.164 |
| 1.604999999999903 | -0.843 | -0.454 | -0.162 |
| 1.609999999999903 | -0.838 | -0.451 | -0.161 |
| 1.614999999999903 | -0.833 | -0.448 | -0.159 |
| 1.619999999999903 | -0.828 | -0.446 | -0.157 |
| 1.624999999999903 | -0.824 | -0.443 | -0.156 |
| 1.629999999999903 | -0.819 | -0.44 | -0.154 |
| 1.634999999999903 | -0.814 | -0.437 | -0.153 |
| 1.639999999999903 | -0.809 | -0.435 | -0.151 |
| 1.644999999999902 | -0.805 | -0.432 | -0.15 |
| 1.649999999999902 | -0.8 | -0.429 | -0.148 |
| 1.654999999999902 | -0.796 | -0.427 | -0.147 |
| 1.659999999999902 | -0.791 | -0.424 | -0.145 |
| 1.664999999999902 | -0.787 | -0.422 | -0.144 |
| 1.669999999999902 | -0.782 | -0.419 | -0.142 |
| 1.674999999999902 | -0.778 | -0.416 | -0.141 |
| 1.679999999999902 | -0.774 | -0.414 | -0.139 |
| 1.684999999999902 | -0.769 | -0.411 | -0.138 |
| 1.689999999999901 | -0.765 | -0.409 | -0.137 |
| 1.694999999999901 | -0.761 | -0.407 | -0.135 |
| 1.699999999999901 | -0.757 | -0.404 | -0.134 |
| 1.704999999999901 | -0.753 | -0.402 | -0.133 |
| 1.709999999999901 | -0.748 | -0.399 | -0.131 |
| 1.714999999999901 | -0.744 | -0.397 | -0.13 |
| 1.719999999999901 | -0.74 | -0.395 | -0.129 |
| 1.724999999999901 | -0.736 | -0.392 | -0.127 |
| 1.729999999999901 | -0.732 | -0.39 | -0.126 |
| 1.734999999999901 | -0.728 | -0.388 | -0.125 |
| 1.7399999999999 | -0.724 | -0.385 | -0.124 |
| 1.7449999999999 | -0.721 | -0.383 | -0.122 |
| 1.7499999999999 | -0.717 | -0.381 | -0.121 |
| 1.7549999999999 | -0.713 | -0.378 | -0.12 |
| 1.7599999999999 | -0.709 | -0.376 | -0.119 |
| 1.7649999999999 | -0.705 | -0.374 | -0.118 |
| 1.7699999999999 | -0.702 | -0.372 | -0.116 |
| 1.7749999999999 | -0.698 | -0.37 | -0.115 |
| 1.7799999999999 | -0.694 | -0.367 | -0.114 |
| 1.784999999999899 | -0.691 | -0.365 | -0.113 |
| 1.789999999999899 | -0.687 | -0.363 | -0.112 |
| 1.794999999999899 | -0.684 | -0.361 | -0.111 |
| 1.799999999999899 | -0.68 | -0.359 | -0.11 |
| 1.804999999999899 | -0.676 | -0.357 | -0.108 |
| 1.809999999999899 | -0.673 | -0.355 | -0.107 |
| 1.814999999999899 | -0.67 | -0.353 | -0.106 |
| 1.819999999999899 | -0.666 | -0.351 | -0.105 |
| 1.824999999999899 | -0.663 | -0.349 | -0.104 |
| 1.829999999999899 | -0.659 | -0.347 | -0.103 |
| 1.834999999999898 | -0.656 | -0.345 | -0.102 |
| 1.839999999999898 | -0.653 | -0.343 | -0.101 |
| 1.844999999999898 | -0.649 | -0.341 | -0.1 |
| 1.849999999999898 | -0.646 | -0.339 | -0.099 |
| 1.854999999999898 | -0.643 | -0.337 | -0.098 |
| 1.859999999999898 | -0.64 | -0.335 | -0.097 |
| 1.864999999999898 | -0.636 | -0.333 | -0.096 |
| 1.869999999999898 | -0.633 | -0.331 | -0.095 |
| 1.874999999999898 | -0.63 | -0.329 | -0.094 |
| 1.879999999999897 | -0.627 | -0.327 | -0.093 |
| 1.884999999999897 | -0.624 | -0.325 | -0.092 |
| 1.889999999999897 | -0.621 | -0.324 | -0.091 |
| 1.894999999999897 | -0.618 | -0.322 | -0.091 |
| 1.899999999999897 | -0.615 | -0.32 | -0.09 |
| 1.904999999999897 | -0.612 | -0.318 | -0.089 |
| 1.909999999999897 | -0.609 | -0.316 | -0.088 |
| 1.914999999999897 | -0.606 | -0.315 | -0.087 |
| 1.919999999999897 | -0.603 | -0.313 | -0.086 |
| 1.924999999999897 | -0.6 | -0.311 | -0.085 |
| 1.929999999999896 | -0.597 | -0.309 | -0.084 |
| 1.934999999999896 | -0.594 | -0.308 | -0.084 |
| 1.939999999999896 | -0.591 | -0.306 | -0.083 |
| 1.944999999999896 | -0.588 | -0.304 | -0.082 |
| 1.949999999999896 | -0.586 | -0.302 | -0.081 |
| 1.954999999999896 | -0.583 | -0.301 | -0.08 |
| 1.959999999999896 | -0.58 | -0.299 | -0.079 |
| 1.964999999999896 | -0.577 | -0.297 | -0.079 |
| 1.969999999999896 | -0.575 | -0.296 | -0.078 |
| 1.974999999999895 | -0.572 | -0.294 | -0.077 |
| 1.979999999999895 | -0.569 | -0.292 | -0.076 |
| 1.984999999999895 | -0.567 | -0.291 | -0.076 |
| 1.989999999999895 | -0.564 | -0.289 | -0.075 |
| 1.994999999999895 | -0.561 | -0.288 | -0.074 |
| 1.999999999999895 | -0.559 | -0.286 | -0.073 |
| 2.004999999999895 | -0.556 | -0.284 | -0.073 |
| 2.009999999999895 | -0.553 | -0.283 | -0.072 |
| 2.014999999999895 | -0.551 | -0.281 | -0.071 |
| 2.019999999999895 | -0.548 | -0.28 | -0.07 |
| 2.024999999999895 | -0.546 | -0.278 | -0.07 |
| 2.029999999999895 | -0.543 | -0.277 | -0.069 |
| 2.034999999999894 | -0.541 | -0.275 | -0.068 |
| 2.039999999999894 | -0.538 | -0.274 | -0.068 |
| 2.044999999999894 | -0.536 | -0.272 | -0.067 |
| 2.049999999999894 | -0.534 | -0.271 | -0.066 |
| 2.054999999999894 | -0.531 | -0.269 | -0.066 |
| 2.059999999999894 | -0.529 | -0.268 | -0.065 |
| 2.064999999999894 | -0.526 | -0.266 | -0.064 |
| 2.069999999999894 | -0.524 | -0.265 | -0.064 |
| 2.074999999999894 | -0.522 | -0.263 | -0.063 |
| 2.079999999999893 | -0.519 | -0.262 | -0.062 |
| 2.084999999999893 | -0.517 | -0.26 | -0.062 |
| 2.089999999999893 | -0.515 | -0.259 | -0.061 |
| 2.094999999999893 | -0.512 | -0.258 | -0.061 |
| 2.099999999999893 | -0.51 | -0.256 | -0.06 |
| 2.104999999999893 | -0.508 | -0.255 | -0.059 |
| 2.109999999999893 | -0.506 | -0.253 | -0.059 |
| 2.114999999999893 | -0.503 | -0.252 | -0.058 |
| 2.119999999999893 | -0.501 | -0.251 | -0.058 |
| 2.124999999999893 | -0.499 | -0.249 | -0.057 |
| 2.129999999999892 | -0.497 | -0.248 | -0.057 |
| 2.134999999999892 | -0.495 | -0.247 | -0.056 |
| 2.139999999999892 | -0.492 | -0.245 | -0.055 |
| 2.144999999999892 | -0.49 | -0.244 | -0.055 |
| 2.149999999999892 | -0.488 | -0.243 | -0.054 |
| 2.154999999999892 | -0.486 | -0.241 | -0.054 |
| 2.159999999999892 | -0.484 | -0.24 | -0.053 |
| 2.164999999999892 | -0.482 | -0.239 | -0.053 |
| 2.169999999999892 | -0.48 | -0.237 | -0.052 |
| 2.174999999999891 | -0.478 | -0.236 | -0.052 |
| 2.179999999999891 | -0.476 | -0.235 | -0.051 |
| 2.184999999999891 | -0.474 | -0.234 | -0.051 |
| 2.189999999999891 | -0.472 | -0.232 | -0.05 |
| 2.194999999999891 | -0.47 | -0.231 | -0.05 |
| 2.199999999999891 | -0.468 | -0.23 | -0.049 |
| 2.204999999999891 | -0.466 | -0.229 | -0.049 |
| 2.209999999999891 | -0.464 | -0.227 | -0.048 |
| 2.214999999999891 | -0.462 | -0.226 | -0.048 |
| 2.21999999999989 | -0.46 | -0.225 | -0.047 |
| 2.22499999999989 | -0.458 | -0.224 | -0.047 |
| 2.22999999999989 | -0.456 | -0.223 | -0.046 |
| 2.23499999999989 | -0.454 | -0.221 | -0.046 |
| 2.23999999999989 | -0.452 | -0.22 | -0.045 |
| 2.24499999999989 | -0.45 | -0.219 | -0.045 |
| 2.24999999999989 | -0.448 | -0.218 | -0.044 |
| 2.25499999999989 | -0.447 | -0.217 | -0.044 |
| 2.25999999999989 | -0.445 | -0.216 | -0.044 |
| 2.26499999999989 | -0.443 | -0.214 | -0.043 |
| 2.269999999999889 | -0.441 | -0.213 | -0.043 |
| 2.274999999999889 | -0.439 | -0.212 | -0.042 |
| 2.279999999999889 | -0.437 | -0.211 | -0.042 |
| 2.284999999999889 | -0.436 | -0.21 | -0.041 |
| 2.289999999999889 | -0.434 | -0.209 | -0.041 |
| 2.294999999999889 | -0.432 | -0.208 | -0.041 |
| 2.299999999999889 | -0.43 | -0.207 | -0.04 |
| 2.304999999999889 | -0.429 | -0.206 | -0.04 |
| 2.309999999999889 | -0.427 | -0.204 | -0.039 |
| 2.314999999999888 | -0.425 | -0.203 | -0.039 |
| 2.319999999999888 | -0.423 | -0.202 | -0.039 |
| 2.324999999999888 | -0.422 | -0.201 | -0.038 |
| 2.329999999999888 | -0.42 | -0.2 | -0.038 |
| 2.334999999999888 | -0.418 | -0.199 | -0.037 |
| 2.339999999999888 | -0.417 | -0.198 | -0.037 |
| 2.344999999999888 | -0.415 | -0.197 | -0.037 |
| 2.349999999999888 | -0.413 | -0.196 | -0.036 |
| 2.354999999999888 | -0.412 | -0.195 | -0.036 |
| 2.359999999999887 | -0.41 | -0.194 | -0.036 |
| 2.364999999999887 | -0.408 | -0.193 | -0.035 |
| 2.369999999999887 | -0.407 | -0.192 | -0.035 |
| 2.374999999999887 | -0.405 | -0.191 | -0.035 |
| 2.379999999999887 | -0.404 | -0.19 | -0.034 |
| 2.384999999999887 | -0.402 | -0.189 | -0.034 |
| 2.389999999999887 | -0.4 | -0.188 | -0.034 |
| 2.394999999999887 | -0.399 | -0.187 | -0.033 |
| 2.399999999999887 | -0.397 | -0.186 | -0.033 |
| 2.404999999999887 | -0.396 | -0.185 | -0.033 |
| 2.409999999999886 | -0.394 | -0.184 | -0.032 |
| 2.414999999999886 | -0.393 | -0.183 | -0.032 |
| 2.419999999999886 | -0.391 | -0.182 | -0.032 |
| 2.424999999999886 | -0.39 | -0.181 | -0.031 |
| 2.429999999999886 | -0.388 | -0.18 | -0.031 |
| 2.434999999999886 | -0.387 | -0.179 | -0.031 |
| 2.439999999999886 | -0.385 | -0.178 | -0.03 |
| 2.444999999999886 | -0.384 | -0.177 | -0.03 |
| 2.449999999999886 | -0.382 | -0.176 | -0.03 |
| 2.454999999999885 | -0.381 | -0.176 | -0.029 |
| 2.459999999999885 | -0.379 | -0.175 | -0.029 |
| 2.464999999999885 | -0.378 | -0.174 | -0.029 |
| 2.469999999999885 | -0.376 | -0.173 | -0.029 |
| 2.474999999999885 | -0.375 | -0.172 | -0.028 |
| 2.479999999999885 | -0.374 | -0.171 | -0.028 |
| 2.484999999999885 | -0.372 | -0.17 | -0.028 |
| 2.489999999999885 | -0.371 | -0.169 | -0.028 |
| 2.494999999999885 | -0.369 | -0.168 | -0.027 |
| 2.499999999999884 | -0.368 | -0.168 | -0.027 |
| 2.504999999999884 | -0.367 | -0.167 | -0.027 |
| 2.509999999999884 | -0.365 | -0.166 | -0.026 |
| 2.514999999999884 | -0.364 | -0.165 | -0.026 |
| 2.519999999999884 | -0.362 | -0.164 | -0.026 |
| 2.524999999999884 | -0.361 | -0.163 | -0.026 |
| 2.529999999999884 | -0.36 | -0.162 | -0.025 |
| 2.534999999999884 | -0.358 | -0.162 | -0.025 |
| 2.539999999999884 | -0.357 | -0.161 | -0.025 |
| 2.544999999999884 | -0.356 | -0.16 | -0.025 |
| 2.549999999999883 | -0.354 | -0.159 | -0.024 |
| 2.554999999999883 | -0.353 | -0.158 | -0.024 |
| 2.559999999999883 | -0.352 | -0.157 | -0.024 |
| 2.564999999999883 | -0.351 | -0.157 | -0.024 |
| 2.569999999999883 | -0.349 | -0.156 | -0.023 |
| 2.574999999999883 | -0.348 | -0.155 | -0.023 |
| 2.579999999999883 | -0.347 | -0.154 | -0.023 |
| 2.584999999999883 | -0.345 | -0.153 | -0.023 |
| 2.589999999999883 | -0.344 | -0.153 | -0.023 |
| 2.594999999999882 | -0.343 | -0.152 | -0.022 |
| 2.599999999999882 | -0.342 | -0.151 | -0.022 |
| 2.604999999999882 | -0.34 | -0.15 | -0.022 |
| 2.609999999999882 | -0.339 | -0.149 | -0.022 |
| 2.614999999999882 | -0.338 | -0.149 | -0.021 |
| 2.619999999999882 | -0.337 | -0.148 | -0.021 |
| 2.624999999999882 | -0.335 | -0.147 | -0.021 |
| 2.629999999999882 | -0.334 | -0.146 | -0.021 |
| 2.634999999999882 | -0.333 | -0.146 | -0.021 |
| 2.639999999999881 | -0.332 | -0.145 | -0.02 |
| 2.644999999999881 | -0.331 | -0.144 | -0.02 |
| 2.649999999999881 | -0.329 | -0.143 | -0.02 |
| 2.654999999999881 | -0.328 | -0.143 | -0.02 |
| 2.659999999999881 | -0.327 | -0.142 | -0.02 |
| 2.664999999999881 | -0.326 | -0.141 | -0.019 |
| 2.669999999999881 | -0.325 | -0.141 | -0.019 |
| 2.674999999999881 | -0.324 | -0.14 | -0.019 |
| 2.679999999999881 | -0.323 | -0.139 | -0.019 |
| 2.68499999999988 | -0.321 | -0.138 | -0.019 |
| 2.68999999999988 | -0.32 | -0.138 | -0.018 |
| 2.69499999999988 | -0.319 | -0.137 | -0.018 |
| 2.69999999999988 | -0.318 | -0.136 | -0.018 |
| 2.70499999999988 | -0.317 | -0.136 | -0.018 |
| 2.70999999999988 | -0.316 | -0.135 | -0.018 |
| 2.71499999999988 | -0.315 | -0.134 | -0.018 |
| 2.71999999999988 | -0.314 | -0.133 | -0.017 |
| 2.72499999999988 | -0.312 | -0.133 | -0.017 |
| 2.72999999999988 | -0.311 | -0.132 | -0.017 |
| 2.734999999999879 | -0.31 | -0.131 | -0.017 |
| 2.739999999999879 | -0.309 | -0.131 | -0.017 |
| 2.744999999999879 | -0.308 | -0.13 | -0.017 |
| 2.749999999999879 | -0.307 | -0.129 | -0.016 |
| 2.754999999999879 | -0.306 | -0.129 | -0.016 |
| 2.759999999999879 | -0.305 | -0.128 | -0.016 |
| 2.764999999999879 | -0.304 | -0.127 | -0.016 |
| 2.769999999999879 | -0.303 | -0.127 | -0.016 |
| 2.774999999999879 | -0.302 | -0.126 | -0.016 |
| 2.779999999999878 | -0.301 | -0.126 | -0.015 |
| 2.784999999999878 | -0.3 | -0.125 | -0.015 |
| 2.789999999999878 | -0.299 | -0.124 | -0.015 |
| 2.794999999999878 | -0.298 | -0.124 | -0.015 |
| 2.799999999999878 | -0.297 | -0.123 | -0.015 |
| 2.804999999999878 | -0.296 | -0.122 | -0.015 |
| 2.809999999999878 | -0.295 | -0.122 | -0.014 |
| 2.814999999999878 | -0.294 | -0.121 | -0.014 |
| 2.819999999999878 | -0.293 | -0.12 | -0.014 |
| 2.824999999999878 | -0.292 | -0.12 | -0.014 |
| 2.829999999999877 | -0.291 | -0.119 | -0.014 |
| 2.834999999999877 | -0.29 | -0.119 | -0.014 |
| 2.839999999999877 | -0.289 | -0.118 | -0.014 |
| 2.844999999999877 | -0.288 | -0.117 | -0.014 |
| 2.849999999999877 | -0.287 | -0.117 | -0.013 |
| 2.854999999999877 | -0.286 | -0.116 | -0.013 |
| 2.859999999999877 | -0.285 | -0.116 | -0.013 |
| 2.864999999999877 | -0.284 | -0.115 | -0.013 |
| 2.869999999999877 | -0.283 | -0.114 | -0.013 |
| 2.874999999999876 | -0.282 | -0.114 | -0.013 |
| 2.879999999999876 | -0.281 | -0.113 | -0.013 |
| 2.884999999999876 | -0.28 | -0.113 | -0.012 |
| 2.889999999999876 | -0.279 | -0.112 | -0.012 |
| 2.894999999999876 | -0.278 | -0.112 | -0.012 |
| 2.899999999999876 | -0.277 | -0.111 | -0.012 |
| 2.904999999999876 | -0.276 | -0.11 | -0.012 |
| 2.909999999999876 | -0.275 | -0.11 | -0.012 |
| 2.914999999999876 | -0.274 | -0.109 | -0.012 |
| 2.919999999999876 | -0.273 | -0.109 | -0.012 |
| 2.924999999999875 | -0.273 | -0.108 | -0.012 |
| 2.929999999999875 | -0.272 | -0.108 | -0.011 |
| 2.934999999999875 | -0.271 | -0.107 | -0.011 |
| 2.939999999999875 | -0.27 | -0.107 | -0.011 |
| 2.944999999999875 | -0.269 | -0.106 | -0.011 |
| 2.949999999999875 | -0.268 | -0.106 | -0.011 |
| 2.954999999999875 | -0.267 | -0.105 | -0.011 |
| 2.959999999999875 | -0.266 | -0.104 | -0.011 |
| 2.964999999999875 | -0.265 | -0.104 | -0.011 |
| 2.969999999999874 | -0.265 | -0.103 | -0.011 |
| 2.974999999999874 | -0.264 | -0.103 | -0.01 |
| 2.979999999999874 | -0.263 | -0.102 | -0.01 |
| 2.984999999999874 | -0.262 | -0.102 | -0.01 |
| 2.989999999999874 | -0.261 | -0.101 | -0.01 |
| 2.994999999999874 | -0.26 | -0.101 | -0.01 |
| 2.999999999999874 | -0.259 | -0.1 | -0.01 |
| 3.004999999999874 | -0.259 | -0.1 | -0.01 |
| 3.009999999999874 | -0.258 | -0.099 | -0.01 |
| 3.014999999999874 | -0.257 | -0.099 | -0.01 |
| 3.019999999999873 | -0.256 | -0.098 | -0.01 |
| 3.024999999999873 | -0.255 | -0.098 | -0.009 |
| 3.029999999999873 | -0.254 | -0.097 | -0.009 |
| 3.034999999999873 | -0.254 | -0.097 | -0.009 |
| 3.039999999999873 | -0.253 | -0.096 | -0.009 |
| 3.044999999999873 | -0.252 | -0.096 | -0.009 |
| 3.049999999999873 | -0.251 | -0.095 | -0.009 |
| 3.054999999999873 | -0.25 | -0.095 | -0.009 |
| 3.059999999999873 | -0.25 | -0.094 | -0.009 |
| 3.064999999999872 | -0.249 | -0.094 | -0.009 |
| 3.069999999999872 | -0.248 | -0.093 | -0.009 |
| 3.074999999999872 | -0.247 | -0.093 | -0.009 |
| 3.079999999999872 | -0.246 | -0.093 | -0.008 |
| 3.084999999999872 | -0.246 | -0.092 | -0.008 |
| 3.089999999999872 | -0.245 | -0.092 | -0.008 |
| 3.094999999999872 | -0.244 | -0.091 | -0.008 |
| 3.099999999999872 | -0.243 | -0.091 | -0.008 |
| 3.104999999999872 | -0.242 | -0.09 | -0.008 |
| 3.109999999999872 | -0.242 | -0.09 | -0.008 |
| 3.114999999999871 | -0.241 | -0.089 | -0.008 |
| 3.119999999999871 | -0.24 | -0.089 | -0.008 |
| 3.124999999999871 | -0.239 | -0.088 | -0.008 |
| 3.129999999999871 | -0.239 | -0.088 | -0.008 |
| 3.134999999999871 | -0.238 | -0.087 | -0.008 |
| 3.139999999999871 | -0.237 | -0.087 | -0.007 |
| 3.144999999999871 | -0.236 | -0.087 | -0.007 |
| 3.149999999999871 | -0.236 | -0.086 | -0.007 |
| 3.154999999999871 | -0.235 | -0.086 | -0.007 |
| 3.15999999999987 | -0.234 | -0.085 | -0.007 |
| 3.16499999999987 | -0.233 | -0.085 | -0.007 |
| 3.16999999999987 | -0.233 | -0.084 | -0.007 |
| 3.17499999999987 | -0.232 | -0.084 | -0.007 |
| 3.17999999999987 | -0.231 | -0.084 | -0.007 |
| 3.18499999999987 | -0.231 | -0.083 | -0.007 |
| 3.18999999999987 | -0.23 | -0.083 | -0.007 |
| 3.19499999999987 | -0.229 | -0.082 | -0.007 |
| 3.19999999999987 | -0.228 | -0.082 | -0.007 |
| 3.204999999999869 | -0.228 | -0.082 | -0.007 |
| 3.209999999999869 | -0.227 | -0.081 | -0.007 |
| 3.214999999999869 | -0.226 | -0.081 | -0.006 |
| 3.219999999999869 | -0.226 | -0.08 | -0.006 |
| 3.224999999999869 | -0.225 | -0.08 | -0.006 |
| 3.229999999999869 | -0.224 | -0.079 | -0.006 |
| 3.234999999999869 | -0.223 | -0.079 | -0.006 |
| 3.239999999999869 | -0.223 | -0.079 | -0.006 |
| 3.244999999999869 | -0.222 | -0.078 | -0.006 |
| 3.249999999999869 | -0.221 | -0.078 | -0.006 |
| 3.254999999999868 | -0.221 | -0.078 | -0.006 |
| 3.259999999999868 | -0.22 | -0.077 | -0.006 |
| 3.264999999999868 | -0.219 | -0.077 | -0.006 |
| 3.269999999999868 | -0.219 | -0.076 | -0.006 |
| 3.274999999999868 | -0.218 | -0.076 | -0.006 |
| 3.279999999999868 | -0.217 | -0.076 | -0.006 |
| 3.284999999999868 | -0.217 | -0.075 | -0.006 |
| 3.289999999999868 | -0.216 | -0.075 | -0.006 |
| 3.294999999999868 | -0.215 | -0.074 | -0.005 |
| 3.299999999999867 | -0.215 | -0.074 | -0.005 |
| 3.304999999999867 | -0.214 | -0.074 | -0.005 |
| 3.309999999999867 | -0.213 | -0.073 | -0.005 |
| 3.314999999999867 | -0.213 | -0.073 | -0.005 |
| 3.319999999999867 | -0.212 | -0.073 | -0.005 |
| 3.324999999999867 | -0.211 | -0.072 | -0.005 |
| 3.329999999999867 | -0.211 | -0.072 | -0.005 |
| 3.334999999999867 | -0.21 | -0.072 | -0.005 |
| 3.339999999999867 | -0.21 | -0.071 | -0.005 |
| 3.344999999999866 | -0.209 | -0.071 | -0.005 |
| 3.349999999999866 | -0.208 | -0.07 | -0.005 |
| 3.354999999999866 | -0.208 | -0.07 | -0.005 |
| 3.359999999999866 | -0.207 | -0.07 | -0.005 |
| 3.364999999999866 | -0.206 | -0.069 | -0.005 |
| 3.369999999999866 | -0.206 | -0.069 | -0.005 |
| 3.374999999999866 | -0.205 | -0.069 | -0.005 |
| 3.379999999999866 | -0.204 | -0.068 | -0.005 |
| 3.384999999999866 | -0.204 | -0.068 | -0.005 |
| 3.389999999999866 | -0.203 | -0.068 | -0.005 |
| 3.394999999999865 | -0.203 | -0.067 | -0.004 |
| 3.399999999999865 | -0.202 | -0.067 | -0.004 |
| 3.404999999999865 | -0.201 | -0.067 | -0.004 |
| 3.409999999999865 | -0.201 | -0.066 | -0.004 |
| 3.414999999999865 | -0.2 | -0.066 | -0.004 |
| 3.419999999999865 | -0.2 | -0.066 | -0.004 |
| 3.424999999999865 | -0.199 | -0.065 | -0.004 |
| 3.429999999999865 | -0.198 | -0.065 | -0.004 |
| 3.434999999999865 | -0.198 | -0.065 | -0.004 |
| 3.439999999999864 | -0.197 | -0.064 | -0.004 |
| 3.444999999999864 | -0.197 | -0.064 | -0.004 |
| 3.449999999999864 | -0.196 | -0.064 | -0.004 |
| 3.454999999999864 | -0.195 | -0.063 | -0.004 |
| 3.459999999999864 | -0.195 | -0.063 | -0.004 |
| 3.464999999999864 | -0.194 | -0.063 | -0.004 |
| 3.469999999999864 | -0.194 | -0.062 | -0.004 |
| 3.474999999999864 | -0.193 | -0.062 | -0.004 |
| 3.479999999999864 | -0.193 | -0.062 | -0.004 |
| 3.484999999999864 | -0.192 | -0.061 | -0.004 |
| 3.489999999999863 | -0.191 | -0.061 | -0.004 |
| 3.494999999999863 | -0.191 | -0.061 | -0.004 |
| 3.499999999999863 | -0.19 | -0.061 | -0.004 |
| 3.504999999999863 | -0.19 | -0.06 | -0.004 |
| 3.509999999999863 | -0.189 | -0.06 | -0.004 |
| 3.514999999999863 | -0.189 | -0.06 | -0.004 |
| 3.519999999999863 | -0.188 | -0.059 | -0.004 |
| 3.524999999999863 | -0.188 | -0.059 | -0.003 |
| 3.529999999999863 | -0.187 | -0.059 | -0.003 |
| 3.534999999999862 | -0.186 | -0.058 | -0.003 |
| 3.539999999999862 | -0.186 | -0.058 | -0.003 |
| 3.544999999999862 | -0.185 | -0.058 | -0.003 |
| 3.549999999999862 | -0.185 | -0.058 | -0.003 |
| 3.554999999999862 | -0.184 | -0.057 | -0.003 |
| 3.559999999999862 | -0.184 | -0.057 | -0.003 |
| 3.564999999999862 | -0.183 | -0.057 | -0.003 |
| 3.569999999999862 | -0.183 | -0.056 | -0.003 |
| 3.574999999999862 | -0.182 | -0.056 | -0.003 |
| 3.579999999999862 | -0.182 | -0.056 | -0.003 |
| 3.584999999999861 | -0.181 | -0.056 | -0.003 |
| 3.589999999999861 | -0.181 | -0.055 | -0.003 |
| 3.594999999999861 | -0.18 | -0.055 | -0.003 |
| 3.599999999999861 | -0.179 | -0.055 | -0.003 |
| 3.604999999999861 | -0.179 | -0.054 | -0.003 |
| 3.609999999999861 | -0.178 | -0.054 | -0.003 |
| 3.614999999999861 | -0.178 | -0.054 | -0.003 |
| 3.619999999999861 | -0.177 | -0.054 | -0.003 |
| 3.62499999999986 | -0.177 | -0.053 | -0.003 |
| 3.62999999999986 | -0.176 | -0.053 | -0.003 |
| 3.63499999999986 | -0.176 | -0.053 | -0.003 |
| 3.63999999999986 | -0.175 | -0.053 | -0.003 |
| 3.64499999999986 | -0.175 | -0.052 | -0.003 |
| 3.64999999999986 | -0.174 | -0.052 | -0.003 |
| 3.65499999999986 | -0.174 | -0.052 | -0.003 |
| 3.65999999999986 | -0.173 | -0.052 | -0.003 |
| 3.66499999999986 | -0.173 | -0.051 | -0.003 |
| 3.669999999999859 | -0.172 | -0.051 | -0.003 |
| 3.674999999999859 | -0.172 | -0.051 | -0.003 |
| 3.679999999999859 | -0.171 | -0.051 | -0.003 |
| 3.684999999999859 | -0.171 | -0.05 | -0.003 |
| 3.689999999999859 | -0.17 | -0.05 | -0.002 |
| 3.694999999999859 | -0.17 | -0.05 | -0.002 |
| 3.699999999999859 | -0.169 | -0.05 | -0.002 |
| 3.704999999999859 | -0.169 | -0.049 | -0.002 |
| 3.709999999999859 | -0.168 | -0.049 | -0.002 |
| 3.714999999999859 | -0.168 | -0.049 | -0.002 |
| 3.719999999999858 | -0.167 | -0.049 | -0.002 |
| 3.724999999999858 | -0.167 | -0.048 | -0.002 |
| 3.729999999999858 | -0.167 | -0.048 | -0.002 |
| 3.734999999999858 | -0.166 | -0.048 | -0.002 |
| 3.739999999999858 | -0.166 | -0.048 | -0.002 |
| 3.744999999999858 | -0.165 | -0.047 | -0.002 |
| 3.749999999999858 | -0.165 | -0.047 | -0.002 |
| 3.754999999999858 | -0.164 | -0.047 | -0.002 |
| 3.759999999999858 | -0.164 | -0.047 | -0.002 |
| 3.764999999999857 | -0.163 | -0.046 | -0.002 |
| 3.769999999999857 | -0.163 | -0.046 | -0.002 |
| 3.774999999999857 | -0.162 | -0.046 | -0.002 |
| 3.779999999999857 | -0.162 | -0.046 | -0.002 |
| 3.784999999999857 | -0.161 | -0.045 | -0.002 |
| 3.789999999999857 | -0.161 | -0.045 | -0.002 |
| 3.794999999999857 | -0.16 | -0.045 | -0.002 |
| 3.799999999999857 | -0.16 | -0.045 | -0.002 |
| 3.804999999999857 | -0.16 | -0.045 | -0.002 |
| 3.809999999999857 | -0.159 | -0.044 | -0.002 |
| 3.814999999999856 | -0.159 | -0.044 | -0.002 |
| 3.819999999999856 | -0.158 | -0.044 | -0.002 |
| 3.824999999999856 | -0.158 | -0.044 | -0.002 |
| 3.829999999999856 | -0.157 | -0.043 | -0.002 |
| 3.834999999999856 | -0.157 | -0.043 | -0.002 |
| 3.839999999999856 | -0.156 | -0.043 | -0.002 |
| 3.844999999999856 | -0.156 | -0.043 | -0.002 |
| 3.849999999999856 | -0.156 | -0.043 | -0.002 |
| 3.854999999999856 | -0.155 | -0.042 | -0.002 |
| 3.859999999999855 | -0.155 | -0.042 | -0.002 |
| 3.864999999999855 | -0.154 | -0.042 | -0.002 |
| 3.869999999999855 | -0.154 | -0.042 | -0.002 |
| 3.874999999999855 | -0.153 | -0.042 | -0.002 |
| 3.879999999999855 | -0.153 | -0.041 | -0.002 |
| 3.884999999999855 | -0.152 | -0.041 | -0.002 |
| 3.889999999999855 | -0.152 | -0.041 | -0.002 |
| 3.894999999999855 | -0.152 | -0.041 | -0.002 |
| 3.899999999999855 | -0.151 | -0.041 | -0.002 |
| 3.904999999999855 | -0.151 | -0.04 | -0.002 |
| 3.909999999999854 | -0.15 | -0.04 | -0.002 |
| 3.914999999999854 | -0.15 | -0.04 | -0.002 |
| 3.919999999999854 | -0.15 | -0.04 | -0.002 |
| 3.924999999999854 | -0.149 | -0.04 | -0.002 |
| 3.929999999999854 | -0.149 | -0.039 | -0.002 |
| 3.934999999999854 | -0.148 | -0.039 | -0.002 |
| 3.939999999999854 | -0.148 | -0.039 | -0.002 |
| 3.944999999999854 | -0.147 | -0.039 | -0.001 |
| 3.949999999999854 | -0.147 | -0.039 | -0.001 |
| 3.954999999999853 | -0.147 | -0.038 | -0.001 |
| 3.959999999999853 | -0.146 | -0.038 | -0.001 |
| 3.964999999999853 | -0.146 | -0.038 | -0.001 |
| 3.969999999999853 | -0.145 | -0.038 | -0.001 |
| 3.974999999999853 | -0.145 | -0.038 | -0.001 |
| 3.979999999999853 | -0.145 | -0.037 | -0.001 |
| 3.984999999999853 | -0.144 | -0.037 | -0.001 |
| 3.989999999999853 | -0.144 | -0.037 | -0.001 |
| 3.994999999999853 | -0.143 | -0.037 | -0.001 |
| 3.999999999999853 | -0.143 | -0.037 | -0.001 |
| 4.004999999999852 | -0.143 | -0.036 | -0.001 |
| 4.009999999999852 | -0.142 | -0.036 | -0.001 |
| 4.014999999999852 | -0.142 | -0.036 | -0.001 |
| 4.019999999999852 | -0.141 | -0.036 | -0.001 |
| 4.024999999999852 | -0.141 | -0.036 | -0.001 |
| 4.029999999999852 | -0.141 | -0.036 | -0.001 |
| 4.034999999999852 | -0.14 | -0.035 | -0.001 |
| 4.039999999999851 | -0.14 | -0.035 | -0.001 |
| 4.044999999999852 | -0.139 | -0.035 | -0.001 |
| 4.049999999999851 | -0.139 | -0.035 | -0.001 |
| 4.054999999999851 | -0.139 | -0.035 | -0.001 |
| 4.059999999999851 | -0.138 | -0.035 | -0.001 |
| 4.064999999999851 | -0.138 | -0.034 | -0.001 |
| 4.069999999999851 | -0.138 | -0.034 | -0.001 |
| 4.074999999999851 | -0.137 | -0.034 | -0.001 |
| 4.07999999999985 | -0.137 | -0.034 | -0.001 |
| 4.084999999999851 | -0.136 | -0.034 | -0.001 |
| 4.08999999999985 | -0.136 | -0.034 | -0.001 |
| 4.094999999999851 | -0.136 | -0.033 | -0.001 |
| 4.09999999999985 | -0.135 | -0.033 | -0.001 |
| 4.10499999999985 | -0.135 | -0.033 | -0.001 |
| 4.10999999999985 | -0.135 | -0.033 | -0.001 |
| 4.11499999999985 | -0.134 | -0.033 | -0.001 |
| 4.11999999999985 | -0.134 | -0.033 | -0.001 |
| 4.12499999999985 | -0.133 | -0.032 | -0.001 |
| 4.12999999999985 | -0.133 | -0.032 | -0.001 |
| 4.13499999999985 | -0.133 | -0.032 | -0.001 |
| 4.13999999999985 | -0.132 | -0.032 | -0.001 |
| 4.144999999999849 | -0.132 | -0.032 | -0.001 |
| 4.14999999999985 | -0.132 | -0.032 | -0.001 |
| 4.154999999999849 | -0.131 | -0.031 | -0.001 |
| 4.15999999999985 | -0.131 | -0.031 | -0.001 |
| 4.164999999999849 | -0.131 | -0.031 | -0.001 |
| 4.169999999999849 | -0.13 | -0.031 | -0.001 |
| 4.174999999999849 | -0.13 | -0.031 | -0.001 |
| 4.179999999999848 | -0.13 | -0.031 | -0.001 |
| 4.184999999999849 | -0.129 | -0.03 | -0.001 |
| 4.189999999999848 | -0.129 | -0.03 | -0.001 |
| 4.194999999999848 | -0.128 | -0.03 | -0.001 |
| 4.199999999999848 | -0.128 | -0.03 | -0.001 |
| 4.204999999999848 | -0.128 | -0.03 | -0.001 |
| 4.209999999999848 | -0.127 | -0.03 | -0.001 |
| 4.214999999999848 | -0.127 | -0.03 | -0.001 |
| 4.219999999999847 | -0.127 | -0.029 | -0.001 |
| 4.224999999999848 | -0.126 | -0.029 | -0.001 |
| 4.229999999999847 | -0.126 | -0.029 | -0.001 |
| 4.234999999999847 | -0.126 | -0.029 | -0.001 |
| 4.239999999999847 | -0.125 | -0.029 | -0.001 |
| 4.244999999999847 | -0.125 | -0.029 | -0.001 |
| 4.249999999999847 | -0.125 | -0.029 | -0.001 |
| 4.254999999999847 | -0.124 | -0.028 | -0.001 |
| 4.259999999999846 | -0.124 | -0.028 | -0.001 |
| 4.264999999999847 | -0.124 | -0.028 | -0.001 |
| 4.269999999999846 | -0.123 | -0.028 | -0.001 |
| 4.274999999999846 | -0.123 | -0.028 | -0.001 |
| 4.279999999999846 | -0.123 | -0.028 | -0.001 |
| 4.284999999999846 | -0.122 | -0.028 | -0.001 |
| 4.289999999999846 | -0.122 | -0.027 | -0.001 |
| 4.294999999999846 | -0.122 | -0.027 | -0.001 |
| 4.299999999999846 | -0.121 | -0.027 | -0.001 |
| 4.304999999999846 | -0.121 | -0.027 | -0.001 |
| 4.309999999999845 | -0.121 | -0.027 | -0.001 |
| 4.314999999999846 | -0.12 | -0.027 | -0.001 |
| 4.319999999999845 | -0.12 | -0.027 | -0.001 |
| 4.324999999999846 | -0.12 | -0.026 | -0.001 |
| 4.329999999999845 | -0.119 | -0.026 | -0.001 |
| 4.334999999999845 | -0.119 | -0.026 | -0.001 |
| 4.339999999999845 | -0.119 | -0.026 | -0.001 |
| 4.344999999999845 | -0.118 | -0.026 | -0.001 |
| 4.349999999999845 | -0.118 | -0.026 | -0.001 |
| 4.354999999999845 | -0.118 | -0.026 | -0.001 |
| 4.359999999999844 | -0.117 | -0.026 | -0.001 |
| 4.364999999999845 | -0.117 | -0.025 | -0.001 |
| 4.369999999999844 | -0.117 | -0.025 | -0.001 |
| 4.374999999999844 | -0.117 | -0.025 | -0.001 |
| 4.379999999999844 | -0.116 | -0.025 | -0.001 |
| 4.384999999999844 | -0.116 | -0.025 | -0.001 |
| 4.389999999999844 | -0.116 | -0.025 | -0.001 |
| 4.394999999999844 | -0.115 | -0.025 | -0.001 |
| 4.399999999999844 | -0.115 | -0.025 | -0.001 |
| 4.404999999999844 | -0.115 | -0.024 | -0.001 |
| 4.409999999999843 | -0.114 | -0.024 | -0.001 |
| 4.414999999999844 | -0.114 | -0.024 | -0.001 |
| 4.419999999999843 | -0.114 | -0.024 | -0.001 |
| 4.424999999999843 | -0.113 | -0.024 | -0.001 |
| 4.429999999999843 | -0.113 | -0.024 | -0.001 |
| 4.434999999999843 | -0.113 | -0.024 | -0.001 |
| 4.439999999999843 | -0.113 | -0.024 | -0.001 |
| 4.444999999999843 | -0.112 | -0.023 | -0.001 |
| 4.449999999999842 | -0.112 | -0.023 | -0.001 |
| 4.454999999999843 | -0.112 | -0.023 | -0.001 |
| 4.459999999999842 | -0.111 | -0.023 | -0.001 |
| 4.464999999999843 | -0.111 | -0.023 | -0.001 |
| 4.469999999999842 | -0.111 | -0.023 | -0.001 |
| 4.474999999999842 | -0.11 | -0.023 | -0.001 |
| 4.479999999999842 | -0.11 | -0.023 | -0.001 |
| 4.484999999999842 | -0.11 | -0.023 | -0.001 |
| 4.489999999999842 | -0.11 | -0.022 | -0.001 |
| 4.494999999999842 | -0.109 | -0.022 | 0 |
| 4.499999999999841 | -0.109 | -0.022 | 0 |
| 4.504999999999842 | -0.109 | -0.022 | 0 |
| 4.509999999999841 | -0.108 | -0.022 | 0 |
| 4.514999999999842 | -0.108 | -0.022 | 0 |
| 4.519999999999841 | -0.108 | -0.022 | 0 |
| 4.524999999999841 | -0.108 | -0.022 | 0 |
| 4.529999999999841 | -0.107 | -0.022 | 0 |
| 4.534999999999841 | -0.107 | -0.021 | 0 |
| 4.53999999999984 | -0.107 | -0.021 | 0 |
| 4.544999999999841 | -0.106 | -0.021 | 0 |
| 4.54999999999984 | -0.106 | -0.021 | 0 |
| 4.554999999999841 | -0.106 | -0.021 | 0 |
| 4.55999999999984 | -0.106 | -0.021 | 0 |
| 4.564999999999841 | -0.105 | -0.021 | 0 |
| 4.56999999999984 | -0.105 | -0.021 | 0 |
| 4.57499999999984 | -0.105 | -0.021 | 0 |
| 4.57999999999984 | -0.104 | -0.021 | 0 |
| 4.58499999999984 | -0.104 | -0.02 | 0 |
| 4.58999999999984 | -0.104 | -0.02 | 0 |
| 4.59499999999984 | -0.104 | -0.02 | 0 |
| 4.59999999999984 | -0.103 | -0.02 | 0 |
| 4.60499999999984 | -0.103 | -0.02 | 0 |
| 4.60999999999984 | -0.103 | -0.02 | 0 |
| 4.614999999999839 | -0.103 | -0.02 | 0 |
| 4.61999999999984 | -0.102 | -0.02 | 0 |
| 4.624999999999839 | -0.102 | -0.02 | 0 |
| 4.62999999999984 | -0.102 | -0.02 | 0 |
| 4.634999999999839 | -0.101 | -0.019 | 0 |
| 4.639999999999838 | -0.101 | -0.019 | 0 |
| 4.644999999999839 | -0.101 | -0.019 | 0 |
| 4.649999999999838 | -0.101 | -0.019 | 0 |
| 4.654999999999839 | -0.1 | -0.019 | 0 |
| 4.659999999999838 | -0.1 | -0.019 | 0 |
| 4.664999999999838 | -0.1 | -0.019 | 0 |
| 4.669999999999838 | -0.1 | -0.019 | 0 |
| 4.674999999999838 | -0.099 | -0.019 | 0 |
| 4.679999999999837 | -0.099 | -0.019 | 0 |
| 4.684999999999838 | -0.099 | -0.018 | 0 |
| 4.689999999999837 | -0.099 | -0.018 | 0 |
| 4.694999999999838 | -0.098 | -0.018 | 0 |
| 4.699999999999837 | -0.098 | -0.018 | 0 |
| 4.704999999999837 | -0.098 | -0.018 | 0 |
| 4.709999999999837 | -0.097 | -0.018 | 0 |
| 4.714999999999837 | -0.097 | -0.018 | 0 |
| 4.719999999999837 | -0.097 | -0.018 | 0 |
| 4.724999999999837 | -0.097 | -0.018 | 0 |
| 4.729999999999836 | -0.096 | -0.018 | 0 |
| 4.734999999999836 | -0.096 | -0.018 | 0 |
| 4.739999999999836 | -0.096 | -0.017 | 0 |
| 4.744999999999836 | -0.096 | -0.017 | 0 |
| 4.749999999999836 | -0.095 | -0.017 | 0 |
| 4.754999999999836 | -0.095 | -0.017 | 0 |
| 4.759999999999836 | -0.095 | -0.017 | 0 |
| 4.764999999999836 | -0.095 | -0.017 | 0 |
| 4.769999999999836 | -0.094 | -0.017 | 0 |
| 4.774999999999835 | -0.094 | -0.017 | 0 |
| 4.779999999999835 | -0.094 | -0.017 | 0 |
| 4.784999999999835 | -0.094 | -0.017 | 0 |
| 4.789999999999835 | -0.093 | -0.017 | 0 |
| 4.794999999999835 | -0.093 | -0.017 | 0 |
| 4.799999999999835 | -0.093 | -0.016 | 0 |
| 4.804999999999835 | -0.093 | -0.016 | 0 |
| 4.809999999999835 | -0.093 | -0.016 | 0 |
| 4.814999999999835 | -0.092 | -0.016 | 0 |
| 4.819999999999835 | -0.092 | -0.016 | 0 |
| 4.824999999999835 | -0.092 | -0.016 | 0 |
| 4.829999999999834 | -0.092 | -0.016 | 0 |
| 4.834999999999834 | -0.091 | -0.016 | 0 |
| 4.839999999999834 | -0.091 | -0.016 | 0 |
| 4.844999999999834 | -0.091 | -0.016 | 0 |
| 4.849999999999834 | -0.091 | -0.016 | 0 |
| 4.854999999999834 | -0.09 | -0.016 | 0 |
| 4.859999999999834 | -0.09 | -0.016 | 0 |
| 4.864999999999834 | -0.09 | -0.015 | 0 |
| 4.869999999999834 | -0.09 | -0.015 | 0 |
| 4.874999999999834 | -0.089 | -0.015 | 0 |
| 4.879999999999833 | -0.089 | -0.015 | 0 |
| 4.884999999999834 | -0.089 | -0.015 | 0 |
| 4.889999999999833 | -0.089 | -0.015 | 0 |
| 4.894999999999833 | -0.088 | -0.015 | 0 |
| 4.899999999999833 | -0.088 | -0.015 | 0 |
| 4.904999999999833 | -0.088 | -0.015 | 0 |
| 4.909999999999833 | -0.088 | -0.015 | 0 |
| 4.914999999999833 | -0.088 | -0.015 | 0 |
| 4.919999999999832 | -0.087 | -0.015 | 0 |
| 4.924999999999833 | -0.087 | -0.015 | 0 |
| 4.929999999999832 | -0.087 | -0.014 | 0 |
| 4.934999999999832 | -0.087 | -0.014 | 0 |
| 4.939999999999832 | -0.086 | -0.014 | 0 |
| 4.944999999999832 | -0.086 | -0.014 | 0 |
| 4.949999999999832 | -0.086 | -0.014 | 0 |
| 4.954999999999832 | -0.086 | -0.014 | 0 |
| 4.959999999999832 | -0.086 | -0.014 | 0 |
| 4.964999999999832 | -0.085 | -0.014 | 0 |
| 4.969999999999831 | -0.085 | -0.014 | 0 |
| 4.974999999999831 | -0.085 | -0.014 | 0 |
| 4.97999999999983 | -0.085 | -0.014 | 0 |
| 4.984999999999831 | -0.084 | -0.014 | 0 |
| 4.98999999999983 | -0.084 | -0.014 | 0 |
| 4.994999999999831 | -0.084 | -0.014 | 0 |
| 4.99999999999983 | -0.084 | -0.013 | 0 |